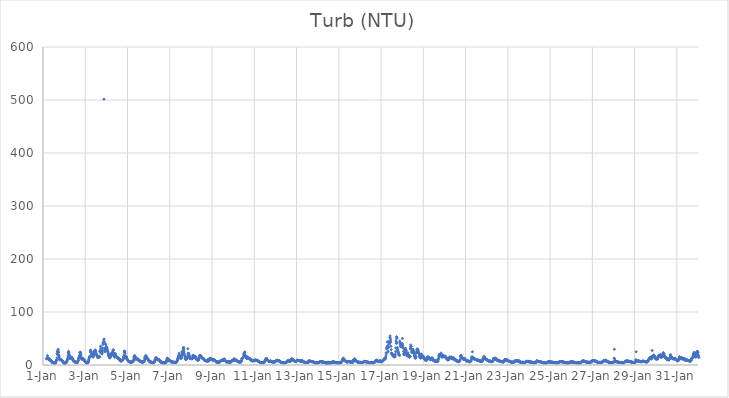
| Category | Turb (NTU) |
|---|---|
| 44562.166666666664 | 11.87 |
| 44562.177083333336 | 12.33 |
| 44562.1875 | 11.19 |
| 44562.197916666664 | 13.07 |
| 44562.208333333336 | 17.6 |
| 44562.21875 | 13.03 |
| 44562.229166666664 | 12.06 |
| 44562.239583333336 | 12.28 |
| 44562.25 | 12.26 |
| 44562.260416666664 | 12.67 |
| 44562.270833333336 | 12.86 |
| 44562.28125 | 11.97 |
| 44562.291666666664 | 9.84 |
| 44562.302083333336 | 9.6 |
| 44562.3125 | 9.68 |
| 44562.322916666664 | 9.43 |
| 44562.333333333336 | 9.88 |
| 44562.34375 | 9.87 |
| 44562.354166666664 | 8.91 |
| 44562.364583333336 | 8.43 |
| 44562.375 | 8.31 |
| 44562.385416666664 | 7.34 |
| 44562.395833333336 | 7.19 |
| 44562.40625 | 6.33 |
| 44562.416666666664 | 6.48 |
| 44562.427083333336 | 5.68 |
| 44562.4375 | 5.01 |
| 44562.447916666664 | 4.82 |
| 44562.458333333336 | 4.68 |
| 44562.46875 | 4.45 |
| 44562.479166666664 | 4.31 |
| 44562.489583333336 | 4.13 |
| 44562.5 | 4.06 |
| 44562.510416666664 | 3.94 |
| 44562.520833333336 | 4 |
| 44562.53125 | 3.86 |
| 44562.541666666664 | 4.03 |
| 44562.552083333336 | 3.84 |
| 44562.5625 | 3.65 |
| 44562.572916666664 | 3.67 |
| 44562.583333333336 | 3.56 |
| 44562.59375 | 4.24 |
| 44562.604166666664 | 6.15 |
| 44562.614583333336 | 5.25 |
| 44562.625 | 8.19 |
| 44562.635416666664 | 8.78 |
| 44562.645833333336 | 8.99 |
| 44562.65625 | 13.36 |
| 44562.666666666664 | 20.85 |
| 44562.677083333336 | 24.94 |
| 44562.6875 | 19.75 |
| 44562.697916666664 | 26.02 |
| 44562.708333333336 | 27.74 |
| 44562.71875 | 29.52 |
| 44562.729166666664 | 23.34 |
| 44562.739583333336 | 24.34 |
| 44562.75 | 18.39 |
| 44562.760416666664 | 15.95 |
| 44562.770833333336 | 12.96 |
| 44562.78125 | 10.43 |
| 44562.791666666664 | 9.8 |
| 44562.802083333336 | 10.56 |
| 44562.8125 | 10.63 |
| 44562.822916666664 | 10.8 |
| 44562.833333333336 | 10.03 |
| 44562.84375 | 10.64 |
| 44562.854166666664 | 9.85 |
| 44562.864583333336 | 9.51 |
| 44562.875 | 9.16 |
| 44562.885416666664 | 8.82 |
| 44562.895833333336 | 8.69 |
| 44562.90625 | 8.57 |
| 44562.916666666664 | 8.16 |
| 44562.927083333336 | 7.28 |
| 44562.9375 | 6.38 |
| 44562.947916666664 | 5.82 |
| 44562.958333333336 | 5.22 |
| 44562.96875 | 4.62 |
| 44562.979166666664 | 4.23 |
| 44562.989583333336 | 3.95 |
| 44563.0 | 3.87 |
| 44563.010416666664 | 3.68 |
| 44563.020833333336 | 3.62 |
| 44563.03125 | 3.65 |
| 44563.041666666664 | 3.76 |
| 44563.052083333336 | 3.66 |
| 44563.0625 | 3.59 |
| 44563.072916666664 | 3.69 |
| 44563.083333333336 | 3.84 |
| 44563.09375 | 4.43 |
| 44563.104166666664 | 5.77 |
| 44563.114583333336 | 6.32 |
| 44563.125 | 5.99 |
| 44563.135416666664 | 7.25 |
| 44563.145833333336 | 8.55 |
| 44563.15625 | 10.62 |
| 44563.166666666664 | 12.01 |
| 44563.177083333336 | 14.79 |
| 44563.1875 | 17.62 |
| 44563.197916666664 | 23.17 |
| 44563.208333333336 | 25.65 |
| 44563.21875 | 22.58 |
| 44563.229166666664 | 24.08 |
| 44563.239583333336 | 19.76 |
| 44563.25 | 18.29 |
| 44563.260416666664 | 16.1 |
| 44563.270833333336 | 13.78 |
| 44563.28125 | 12.2 |
| 44563.291666666664 | 12.46 |
| 44563.302083333336 | 13.33 |
| 44563.3125 | 14.45 |
| 44563.322916666664 | 14.23 |
| 44563.333333333336 | 13.48 |
| 44563.34375 | 14.12 |
| 44563.354166666664 | 14.63 |
| 44563.364583333336 | 12.54 |
| 44563.375 | 12.17 |
| 44563.385416666664 | 12.93 |
| 44563.395833333336 | 11.62 |
| 44563.40625 | 11.87 |
| 44563.416666666664 | 9.66 |
| 44563.427083333336 | 8.95 |
| 44563.4375 | 8.39 |
| 44563.447916666664 | 7.69 |
| 44563.458333333336 | 7.07 |
| 44563.46875 | 6.66 |
| 44563.479166666664 | 6.58 |
| 44563.489583333336 | 6.34 |
| 44563.5 | 5.87 |
| 44563.510416666664 | 5.73 |
| 44563.520833333336 | 5.81 |
| 44563.53125 | 5.25 |
| 44563.541666666664 | 5.42 |
| 44563.552083333336 | 5.41 |
| 44563.5625 | 5.13 |
| 44563.572916666664 | 5 |
| 44563.583333333336 | 4.76 |
| 44563.59375 | 4.59 |
| 44563.604166666664 | 4.41 |
| 44563.614583333336 | 4.5 |
| 44563.625 | 4.77 |
| 44563.635416666664 | 4.74 |
| 44563.645833333336 | 6.84 |
| 44563.65625 | 8.32 |
| 44563.666666666664 | 9.4 |
| 44563.677083333336 | 8.82 |
| 44563.6875 | 12.52 |
| 44563.697916666664 | 14.56 |
| 44563.708333333336 | 14.4 |
| 44563.71875 | 16.66 |
| 44563.729166666664 | 17.57 |
| 44563.739583333336 | 23.82 |
| 44563.75 | 20.22 |
| 44563.760416666664 | 24.24 |
| 44563.770833333336 | 23.83 |
| 44563.78125 | 22.1 |
| 44563.791666666664 | 19.54 |
| 44563.802083333336 | 16.95 |
| 44563.8125 | 13.77 |
| 44563.822916666664 | 11.88 |
| 44563.833333333336 | 11.06 |
| 44563.84375 | 11.74 |
| 44563.854166666664 | 12.36 |
| 44563.864583333336 | 12.05 |
| 44563.875 | 11.91 |
| 44563.885416666664 | 11.82 |
| 44563.895833333336 | 11.77 |
| 44563.90625 | 11.4 |
| 44563.916666666664 | 9.82 |
| 44563.927083333336 | 9.42 |
| 44563.9375 | 10.38 |
| 44563.947916666664 | 9.44 |
| 44563.958333333336 | 8.57 |
| 44563.96875 | 8.02 |
| 44563.979166666664 | 7.27 |
| 44563.989583333336 | 6.69 |
| 44564.0 | 7.07 |
| 44564.010416666664 | 5.65 |
| 44564.020833333336 | 5.23 |
| 44564.03125 | 4.83 |
| 44564.041666666664 | 4.48 |
| 44564.052083333336 | 4.26 |
| 44564.0625 | 4.42 |
| 44564.072916666664 | 4.67 |
| 44564.083333333336 | 4.31 |
| 44564.09375 | 4.08 |
| 44564.104166666664 | 4.32 |
| 44564.114583333336 | 4.35 |
| 44564.125 | 4.79 |
| 44564.135416666664 | 4.95 |
| 44564.145833333336 | 6.38 |
| 44564.15625 | 9.54 |
| 44564.166666666664 | 7.64 |
| 44564.177083333336 | 11.81 |
| 44564.1875 | 15.1 |
| 44564.197916666664 | 15.05 |
| 44564.208333333336 | 15.42 |
| 44564.21875 | 15.52 |
| 44564.229166666664 | 17.11 |
| 44564.239583333336 | 24.64 |
| 44564.25 | 28.03 |
| 44564.260416666664 | 26.59 |
| 44564.270833333336 | 25.41 |
| 44564.28125 | 23.19 |
| 44564.291666666664 | 22.75 |
| 44564.302083333336 | 20.21 |
| 44564.3125 | 18.89 |
| 44564.322916666664 | 17.23 |
| 44564.333333333336 | 16.7 |
| 44564.34375 | 17.23 |
| 44564.354166666664 | 19.74 |
| 44564.364583333336 | 18.64 |
| 44564.375 | 14.87 |
| 44564.385416666664 | 16.54 |
| 44564.395833333336 | 18.51 |
| 44564.40625 | 21.49 |
| 44564.416666666664 | 25.74 |
| 44564.427083333336 | 25.84 |
| 44564.4375 | 25.01 |
| 44564.447916666664 | 26.96 |
| 44564.458333333336 | 27.28 |
| 44564.46875 | 27.46 |
| 44564.479166666664 | 28.1 |
| 44564.489583333336 | 26.2 |
| 44564.5 | 24.45 |
| 44564.510416666664 | 21.83 |
| 44564.520833333336 | 20.83 |
| 44564.53125 | 19.97 |
| 44564.541666666664 | 18.99 |
| 44564.552083333336 | 18.12 |
| 44564.5625 | 16.41 |
| 44564.572916666664 | 14.63 |
| 44564.583333333336 | 14.82 |
| 44564.59375 | 14.29 |
| 44564.604166666664 | 13.79 |
| 44564.614583333336 | 14.65 |
| 44564.625 | 15.38 |
| 44564.635416666664 | 15.62 |
| 44564.645833333336 | 14.66 |
| 44564.65625 | 15.41 |
| 44564.666666666664 | 16.86 |
| 44564.677083333336 | 15.53 |
| 44564.6875 | 25.09 |
| 44564.697916666664 | 27.29 |
| 44564.708333333336 | 26.28 |
| 44564.71875 | 35.2 |
| 44564.729166666664 | 26.45 |
| 44564.739583333336 | 30.86 |
| 44564.75 | 25.49 |
| 44564.760416666664 | 22.16 |
| 44564.770833333336 | 23.63 |
| 44564.78125 | 23.73 |
| 44564.791666666664 | 23.66 |
| 44564.802083333336 | 21.17 |
| 44564.8125 | 31.92 |
| 44564.822916666664 | 27.49 |
| 44564.833333333336 | 38.8 |
| 44564.84375 | 42.27 |
| 44564.854166666664 | 40.99 |
| 44564.864583333336 | 42.98 |
| 44564.875 | 47.48 |
| 44564.885416666664 | 501.5 |
| 44564.895833333336 | 48.89 |
| 44564.90625 | 43.59 |
| 44564.916666666664 | 31.32 |
| 44564.927083333336 | 26.12 |
| 44564.9375 | 25.48 |
| 44564.947916666664 | 29.15 |
| 44564.958333333336 | 38.98 |
| 44564.96875 | 38.8 |
| 44564.979166666664 | 29.47 |
| 44564.989583333336 | 33.99 |
| 44565.0 | 33.92 |
| 44565.010416666664 | 34.01 |
| 44565.020833333336 | 32.43 |
| 44565.03125 | 31.24 |
| 44565.041666666664 | 28.65 |
| 44565.052083333336 | 27.05 |
| 44565.0625 | 25.4 |
| 44565.072916666664 | 23.75 |
| 44565.083333333336 | 22.18 |
| 44565.09375 | 18.03 |
| 44565.104166666664 | 19.26 |
| 44565.114583333336 | 17.18 |
| 44565.125 | 19.57 |
| 44565.135416666664 | 14.8 |
| 44565.145833333336 | 13.68 |
| 44565.15625 | 13.51 |
| 44565.166666666664 | 16.06 |
| 44565.177083333336 | 15.92 |
| 44565.1875 | 14.07 |
| 44565.197916666664 | 16.85 |
| 44565.208333333336 | 16.8 |
| 44565.21875 | 20.48 |
| 44565.229166666664 | 17.52 |
| 44565.239583333336 | 17.49 |
| 44565.25 | 22.36 |
| 44565.260416666664 | 22.65 |
| 44565.270833333336 | 20.27 |
| 44565.28125 | 22.79 |
| 44565.291666666664 | 21.32 |
| 44565.302083333336 | 23.85 |
| 44565.3125 | 27.18 |
| 44565.322916666664 | 28.89 |
| 44565.333333333336 | 27.66 |
| 44565.34375 | 23.05 |
| 44565.354166666664 | 19.9 |
| 44565.364583333336 | 19.01 |
| 44565.375 | 17.16 |
| 44565.385416666664 | 15.95 |
| 44565.395833333336 | 14.79 |
| 44565.40625 | 19.18 |
| 44565.416666666664 | 19.34 |
| 44565.427083333336 | 21.53 |
| 44565.4375 | 17.85 |
| 44565.447916666664 | 16.26 |
| 44565.458333333336 | 16.37 |
| 44565.46875 | 15.8 |
| 44565.479166666664 | 14.9 |
| 44565.489583333336 | 14.27 |
| 44565.5 | 14.01 |
| 44565.510416666664 | 14.61 |
| 44565.520833333336 | 14.1 |
| 44565.53125 | 13.87 |
| 44565.541666666664 | 13.44 |
| 44565.552083333336 | 12.83 |
| 44565.5625 | 12.48 |
| 44565.572916666664 | 12.09 |
| 44565.583333333336 | 11.77 |
| 44565.59375 | 11.38 |
| 44565.604166666664 | 11.29 |
| 44565.614583333336 | 11.36 |
| 44565.625 | 10.97 |
| 44565.635416666664 | 9.95 |
| 44565.645833333336 | 10.29 |
| 44565.65625 | 8.15 |
| 44565.666666666664 | 7.56 |
| 44565.677083333336 | 7.98 |
| 44565.6875 | 7.72 |
| 44565.697916666664 | 8.15 |
| 44565.708333333336 | 8.54 |
| 44565.71875 | 7.9 |
| 44565.729166666664 | 7.39 |
| 44565.739583333336 | 8.46 |
| 44565.75 | 8.84 |
| 44565.760416666664 | 8.78 |
| 44565.770833333336 | 10.27 |
| 44565.78125 | 10.83 |
| 44565.791666666664 | 10.24 |
| 44565.802083333336 | 12.97 |
| 44565.8125 | 14.79 |
| 44565.822916666664 | 15.74 |
| 44565.833333333336 | 18.82 |
| 44565.84375 | 24.3 |
| 44565.854166666664 | 26.4 |
| 44565.864583333336 | 25.36 |
| 44565.875 | 25.13 |
| 44565.885416666664 | 22.09 |
| 44565.895833333336 | 16.62 |
| 44565.90625 | 13.31 |
| 44565.916666666664 | 14.26 |
| 44565.927083333336 | 14.68 |
| 44565.9375 | 15.62 |
| 44565.947916666664 | 15.09 |
| 44565.958333333336 | 14.62 |
| 44565.96875 | 12.5 |
| 44565.979166666664 | 10.67 |
| 44565.989583333336 | 10.74 |
| 44566.0 | 9.47 |
| 44566.010416666664 | 9.03 |
| 44566.020833333336 | 8.73 |
| 44566.03125 | 8.12 |
| 44566.041666666664 | 7.81 |
| 44566.052083333336 | 7.04 |
| 44566.0625 | 6.72 |
| 44566.072916666664 | 6.59 |
| 44566.083333333336 | 6.33 |
| 44566.09375 | 6.26 |
| 44566.104166666664 | 5.79 |
| 44566.114583333336 | 5.65 |
| 44566.125 | 5.73 |
| 44566.135416666664 | 5.37 |
| 44566.145833333336 | 5.38 |
| 44566.15625 | 5.63 |
| 44566.166666666664 | 5.41 |
| 44566.177083333336 | 5.2 |
| 44566.1875 | 5.2 |
| 44566.197916666664 | 5.09 |
| 44566.208333333336 | 5.43 |
| 44566.21875 | 6.01 |
| 44566.229166666664 | 6.21 |
| 44566.239583333336 | 6.5 |
| 44566.25 | 6.62 |
| 44566.260416666664 | 6.8 |
| 44566.270833333336 | 7.51 |
| 44566.28125 | 8.62 |
| 44566.291666666664 | 10.92 |
| 44566.302083333336 | 14.37 |
| 44566.3125 | 15.92 |
| 44566.322916666664 | 15.14 |
| 44566.333333333336 | 17.74 |
| 44566.34375 | 15.79 |
| 44566.354166666664 | 13.89 |
| 44566.364583333336 | 16.73 |
| 44566.375 | 13.22 |
| 44566.385416666664 | 11.43 |
| 44566.395833333336 | 10.72 |
| 44566.40625 | 11.94 |
| 44566.416666666664 | 11.54 |
| 44566.427083333336 | 11.24 |
| 44566.4375 | 12.31 |
| 44566.447916666664 | 11.96 |
| 44566.458333333336 | 12.26 |
| 44566.46875 | 11.6 |
| 44566.479166666664 | 10.86 |
| 44566.489583333336 | 10.03 |
| 44566.5 | 9.4 |
| 44566.510416666664 | 9.4 |
| 44566.520833333336 | 9.75 |
| 44566.53125 | 9.52 |
| 44566.541666666664 | 9.24 |
| 44566.552083333336 | 8.59 |
| 44566.5625 | 9.1 |
| 44566.572916666664 | 7.66 |
| 44566.583333333336 | 7.56 |
| 44566.59375 | 6.94 |
| 44566.604166666664 | 6.85 |
| 44566.614583333336 | 6.66 |
| 44566.625 | 6.6 |
| 44566.635416666664 | 6.29 |
| 44566.645833333336 | 5.96 |
| 44566.65625 | 5.85 |
| 44566.666666666664 | 6.3 |
| 44566.677083333336 | 6.08 |
| 44566.6875 | 5.56 |
| 44566.697916666664 | 5.28 |
| 44566.708333333336 | 5.14 |
| 44566.71875 | 5.29 |
| 44566.729166666664 | 6.48 |
| 44566.739583333336 | 6.16 |
| 44566.75 | 6.08 |
| 44566.760416666664 | 6.26 |
| 44566.770833333336 | 5.87 |
| 44566.78125 | 6.82 |
| 44566.791666666664 | 6.74 |
| 44566.802083333336 | 8.95 |
| 44566.8125 | 14.7 |
| 44566.822916666664 | 12.36 |
| 44566.833333333336 | 12 |
| 44566.84375 | 13.57 |
| 44566.854166666664 | 16.04 |
| 44566.864583333336 | 17.65 |
| 44566.875 | 16.55 |
| 44566.885416666664 | 16.57 |
| 44566.895833333336 | 14.19 |
| 44566.90625 | 13.72 |
| 44566.916666666664 | 12.51 |
| 44566.927083333336 | 11.72 |
| 44566.9375 | 11.74 |
| 44566.947916666664 | 11.47 |
| 44566.958333333336 | 11.43 |
| 44566.96875 | 11.4 |
| 44566.979166666664 | 10.87 |
| 44566.989583333336 | 9.86 |
| 44567.0 | 8.65 |
| 44567.010416666664 | 8.23 |
| 44567.020833333336 | 7.29 |
| 44567.03125 | 6.73 |
| 44567.041666666664 | 6.52 |
| 44567.052083333336 | 6.26 |
| 44567.0625 | 5.77 |
| 44567.072916666664 | 5.83 |
| 44567.083333333336 | 5.66 |
| 44567.09375 | 5.38 |
| 44567.104166666664 | 5.42 |
| 44567.114583333336 | 5.45 |
| 44567.125 | 5.48 |
| 44567.135416666664 | 5.27 |
| 44567.145833333336 | 4.66 |
| 44567.15625 | 4.5 |
| 44567.166666666664 | 4.41 |
| 44567.177083333336 | 4.62 |
| 44567.1875 | 4.53 |
| 44567.197916666664 | 4.09 |
| 44567.208333333336 | 4.19 |
| 44567.21875 | 4.21 |
| 44567.229166666664 | 4.34 |
| 44567.239583333336 | 5.17 |
| 44567.25 | 5.42 |
| 44567.260416666664 | 5.83 |
| 44567.270833333336 | 5.97 |
| 44567.28125 | 6.25 |
| 44567.291666666664 | 7.7 |
| 44567.302083333336 | 9.53 |
| 44567.3125 | 10.76 |
| 44567.322916666664 | 10.49 |
| 44567.333333333336 | 11.66 |
| 44567.34375 | 13.93 |
| 44567.354166666664 | 13.69 |
| 44567.364583333336 | 12.6 |
| 44567.375 | 12.5 |
| 44567.385416666664 | 12.06 |
| 44567.395833333336 | 12.45 |
| 44567.40625 | 11.75 |
| 44567.416666666664 | 10.6 |
| 44567.427083333336 | 9.63 |
| 44567.4375 | 10.24 |
| 44567.447916666664 | 10.51 |
| 44567.458333333336 | 10.38 |
| 44567.46875 | 9.95 |
| 44567.479166666664 | 9.36 |
| 44567.489583333336 | 9.79 |
| 44567.5 | 9.54 |
| 44567.510416666664 | 9.33 |
| 44567.520833333336 | 8.41 |
| 44567.53125 | 7.57 |
| 44567.541666666664 | 6.85 |
| 44567.552083333336 | 6.25 |
| 44567.5625 | 5.75 |
| 44567.572916666664 | 5.85 |
| 44567.583333333336 | 5.68 |
| 44567.59375 | 5.33 |
| 44567.604166666664 | 5.33 |
| 44567.614583333336 | 5.5 |
| 44567.625 | 5.37 |
| 44567.635416666664 | 5.04 |
| 44567.645833333336 | 4.71 |
| 44567.65625 | 4.59 |
| 44567.666666666664 | 4.19 |
| 44567.677083333336 | 5.15 |
| 44567.6875 | 4.32 |
| 44567.697916666664 | 4.59 |
| 44567.708333333336 | 4.65 |
| 44567.71875 | 3.88 |
| 44567.729166666664 | 3.65 |
| 44567.739583333336 | 3.75 |
| 44567.75 | 3.86 |
| 44567.760416666664 | 3.88 |
| 44567.770833333336 | 4.3 |
| 44567.78125 | 4.6 |
| 44567.791666666664 | 4.29 |
| 44567.802083333336 | 3.92 |
| 44567.8125 | 4.47 |
| 44567.822916666664 | 4.73 |
| 44567.833333333336 | 6.36 |
| 44567.84375 | 7.47 |
| 44567.854166666664 | 8.92 |
| 44567.864583333336 | 10.87 |
| 44567.875 | 12.91 |
| 44567.885416666664 | 12.53 |
| 44567.895833333336 | 11.28 |
| 44567.90625 | 11.83 |
| 44567.916666666664 | 10.72 |
| 44567.927083333336 | 10.31 |
| 44567.9375 | 10.02 |
| 44567.947916666664 | 8.9 |
| 44567.958333333336 | 7.92 |
| 44567.96875 | 8.92 |
| 44567.979166666664 | 9.29 |
| 44567.989583333336 | 8.71 |
| 44568.0 | 8.71 |
| 44568.010416666664 | 8.51 |
| 44568.020833333336 | 7.76 |
| 44568.03125 | 7.36 |
| 44568.041666666664 | 6.78 |
| 44568.052083333336 | 6.56 |
| 44568.0625 | 5.97 |
| 44568.072916666664 | 6.09 |
| 44568.083333333336 | 5.91 |
| 44568.09375 | 5.78 |
| 44568.104166666664 | 5.77 |
| 44568.114583333336 | 5.69 |
| 44568.125 | 5.8 |
| 44568.135416666664 | 5.69 |
| 44568.145833333336 | 5.83 |
| 44568.15625 | 5.46 |
| 44568.166666666664 | 5.32 |
| 44568.177083333336 | 5.25 |
| 44568.1875 | 5.06 |
| 44568.197916666664 | 4.97 |
| 44568.208333333336 | 4.77 |
| 44568.21875 | 4.93 |
| 44568.229166666664 | 4.75 |
| 44568.239583333336 | 4.2 |
| 44568.25 | 4.31 |
| 44568.260416666664 | 4.37 |
| 44568.270833333336 | 4.55 |
| 44568.28125 | 4.89 |
| 44568.291666666664 | 5.2 |
| 44568.302083333336 | 4.96 |
| 44568.3125 | 5.34 |
| 44568.322916666664 | 5.72 |
| 44568.333333333336 | 6.73 |
| 44568.34375 | 7.7 |
| 44568.354166666664 | 8.11 |
| 44568.364583333336 | 11.15 |
| 44568.375 | 12.84 |
| 44568.385416666664 | 9.77 |
| 44568.395833333336 | 12.23 |
| 44568.40625 | 15.03 |
| 44568.416666666664 | 16.91 |
| 44568.427083333336 | 17.48 |
| 44568.4375 | 21.72 |
| 44568.447916666664 | 19.45 |
| 44568.458333333336 | 18.12 |
| 44568.46875 | 16.16 |
| 44568.479166666664 | 15.79 |
| 44568.489583333336 | 14.37 |
| 44568.5 | 13.18 |
| 44568.510416666664 | 13.38 |
| 44568.520833333336 | 13.1 |
| 44568.53125 | 12.41 |
| 44568.541666666664 | 12.92 |
| 44568.552083333336 | 13.34 |
| 44568.5625 | 16.85 |
| 44568.572916666664 | 23.58 |
| 44568.583333333336 | 25.5 |
| 44568.59375 | 20.39 |
| 44568.604166666664 | 19.04 |
| 44568.614583333336 | 22.1 |
| 44568.625 | 23.83 |
| 44568.635416666664 | 30.63 |
| 44568.645833333336 | 32.35 |
| 44568.65625 | 33.22 |
| 44568.666666666664 | 28.62 |
| 44568.677083333336 | 24.25 |
| 44568.6875 | 20.74 |
| 44568.697916666664 | 18.27 |
| 44568.708333333336 | 17.56 |
| 44568.71875 | 14.92 |
| 44568.729166666664 | 13.02 |
| 44568.739583333336 | 12.03 |
| 44568.75 | 11.65 |
| 44568.760416666664 | 10.11 |
| 44568.770833333336 | 10.85 |
| 44568.78125 | 11.13 |
| 44568.791666666664 | 12.66 |
| 44568.802083333336 | 13.08 |
| 44568.8125 | 11.85 |
| 44568.822916666664 | 12.09 |
| 44568.833333333336 | 13.07 |
| 44568.84375 | 16.62 |
| 44568.854166666664 | 30.62 |
| 44568.864583333336 | 21.83 |
| 44568.875 | 19.83 |
| 44568.885416666664 | 21.8 |
| 44568.895833333336 | 21.8 |
| 44568.90625 | 20.19 |
| 44568.916666666664 | 17.95 |
| 44568.927083333336 | 16.7 |
| 44568.9375 | 15.62 |
| 44568.947916666664 | 14.97 |
| 44568.958333333336 | 11.89 |
| 44568.96875 | 13.52 |
| 44568.979166666664 | 13.17 |
| 44568.989583333336 | 12.1 |
| 44569.0 | 11.88 |
| 44569.010416666664 | 12.4 |
| 44569.020833333336 | 11.82 |
| 44569.03125 | 11.92 |
| 44569.041666666664 | 12.18 |
| 44569.052083333336 | 11.55 |
| 44569.0625 | 12.36 |
| 44569.072916666664 | 13.78 |
| 44569.083333333336 | 14.84 |
| 44569.09375 | 18.26 |
| 44569.104166666664 | 17.56 |
| 44569.114583333336 | 17.19 |
| 44569.125 | 14.45 |
| 44569.135416666664 | 13.52 |
| 44569.145833333336 | 13.5 |
| 44569.15625 | 14.31 |
| 44569.166666666664 | 15.48 |
| 44569.177083333336 | 15.94 |
| 44569.1875 | 16.9 |
| 44569.197916666664 | 16.42 |
| 44569.208333333336 | 15.45 |
| 44569.21875 | 15.19 |
| 44569.229166666664 | 13.52 |
| 44569.239583333336 | 14.1 |
| 44569.25 | 11.49 |
| 44569.260416666664 | 11.8 |
| 44569.270833333336 | 10.54 |
| 44569.28125 | 9.97 |
| 44569.291666666664 | 10 |
| 44569.302083333336 | 10.35 |
| 44569.3125 | 9.71 |
| 44569.322916666664 | 9.11 |
| 44569.333333333336 | 8.58 |
| 44569.34375 | 9.3 |
| 44569.354166666664 | 9.59 |
| 44569.364583333336 | 10.01 |
| 44569.375 | 11.99 |
| 44569.385416666664 | 13.29 |
| 44569.395833333336 | 15.45 |
| 44569.40625 | 16.77 |
| 44569.416666666664 | 17.95 |
| 44569.427083333336 | 17.63 |
| 44569.4375 | 17.05 |
| 44569.447916666664 | 17.85 |
| 44569.458333333336 | 17.6 |
| 44569.46875 | 17.54 |
| 44569.479166666664 | 16.24 |
| 44569.489583333336 | 15.45 |
| 44569.5 | 14.42 |
| 44569.510416666664 | 13.49 |
| 44569.520833333336 | 13.47 |
| 44569.53125 | 13.72 |
| 44569.541666666664 | 13.28 |
| 44569.552083333336 | 12.54 |
| 44569.5625 | 12.39 |
| 44569.572916666664 | 12.09 |
| 44569.583333333336 | 12.28 |
| 44569.59375 | 12.17 |
| 44569.604166666664 | 11.72 |
| 44569.614583333336 | 11.49 |
| 44569.625 | 10 |
| 44569.635416666664 | 9.07 |
| 44569.645833333336 | 8.88 |
| 44569.65625 | 8.35 |
| 44569.666666666664 | 8.23 |
| 44569.677083333336 | 7.99 |
| 44569.6875 | 8.42 |
| 44569.697916666664 | 8.16 |
| 44569.708333333336 | 8.1 |
| 44569.71875 | 8 |
| 44569.729166666664 | 8.13 |
| 44569.739583333336 | 7.89 |
| 44569.75 | 7.33 |
| 44569.760416666664 | 7.73 |
| 44569.770833333336 | 7.89 |
| 44569.78125 | 7.37 |
| 44569.791666666664 | 6.82 |
| 44569.802083333336 | 7.15 |
| 44569.8125 | 10.97 |
| 44569.822916666664 | 8.96 |
| 44569.833333333336 | 7.81 |
| 44569.84375 | 8.39 |
| 44569.854166666664 | 7.65 |
| 44569.864583333336 | 8.01 |
| 44569.875 | 10.22 |
| 44569.885416666664 | 11.67 |
| 44569.895833333336 | 12.61 |
| 44569.90625 | 12.55 |
| 44569.916666666664 | 12.11 |
| 44569.927083333336 | 11.99 |
| 44569.9375 | 12.42 |
| 44569.947916666664 | 11.39 |
| 44569.958333333336 | 11.27 |
| 44569.96875 | 10.75 |
| 44569.979166666664 | 10.44 |
| 44569.989583333336 | 10.54 |
| 44570.0 | 11.01 |
| 44570.010416666664 | 10.26 |
| 44570.020833333336 | 9.94 |
| 44570.03125 | 9.29 |
| 44570.041666666664 | 9.34 |
| 44570.052083333336 | 9.18 |
| 44570.0625 | 9.92 |
| 44570.072916666664 | 10.33 |
| 44570.083333333336 | 9.82 |
| 44570.09375 | 9.99 |
| 44570.104166666664 | 9.94 |
| 44570.114583333336 | 9.57 |
| 44570.125 | 8.83 |
| 44570.135416666664 | 7.97 |
| 44570.145833333336 | 7.82 |
| 44570.15625 | 7.52 |
| 44570.166666666664 | 6.9 |
| 44570.177083333336 | 6.4 |
| 44570.1875 | 6.07 |
| 44570.197916666664 | 5.76 |
| 44570.208333333336 | 5.81 |
| 44570.21875 | 5.64 |
| 44570.229166666664 | 5.52 |
| 44570.239583333336 | 5.4 |
| 44570.25 | 5.44 |
| 44570.260416666664 | 6.01 |
| 44570.270833333336 | 5.62 |
| 44570.28125 | 5.62 |
| 44570.291666666664 | 5.21 |
| 44570.302083333336 | 5.11 |
| 44570.3125 | 5.08 |
| 44570.322916666664 | 5.36 |
| 44570.333333333336 | 5.38 |
| 44570.34375 | 5.92 |
| 44570.354166666664 | 5.33 |
| 44570.364583333336 | 5.56 |
| 44570.375 | 6.57 |
| 44570.385416666664 | 7.48 |
| 44570.395833333336 | 6.99 |
| 44570.40625 | 8.09 |
| 44570.416666666664 | 8.39 |
| 44570.427083333336 | 8.25 |
| 44570.4375 | 8.56 |
| 44570.447916666664 | 8.35 |
| 44570.458333333336 | 8.2 |
| 44570.46875 | 8.35 |
| 44570.479166666664 | 8.4 |
| 44570.489583333336 | 8.81 |
| 44570.5 | 8.88 |
| 44570.510416666664 | 9.86 |
| 44570.520833333336 | 10.62 |
| 44570.53125 | 9.38 |
| 44570.541666666664 | 8.34 |
| 44570.552083333336 | 9.92 |
| 44570.5625 | 9.25 |
| 44570.572916666664 | 11.41 |
| 44570.583333333336 | 11.14 |
| 44570.59375 | 9.86 |
| 44570.604166666664 | 9.49 |
| 44570.614583333336 | 8.65 |
| 44570.625 | 8.01 |
| 44570.635416666664 | 7.43 |
| 44570.645833333336 | 7.01 |
| 44570.65625 | 6.74 |
| 44570.666666666664 | 6.34 |
| 44570.677083333336 | 6.03 |
| 44570.6875 | 5.83 |
| 44570.697916666664 | 5.5 |
| 44570.708333333336 | 5.83 |
| 44570.71875 | 6.74 |
| 44570.729166666664 | 6.04 |
| 44570.739583333336 | 6.38 |
| 44570.75 | 6.31 |
| 44570.760416666664 | 6.08 |
| 44570.770833333336 | 5.8 |
| 44570.78125 | 5.93 |
| 44570.791666666664 | 5.6 |
| 44570.802083333336 | 6.53 |
| 44570.8125 | 5.5 |
| 44570.822916666664 | 5.19 |
| 44570.833333333336 | 5.32 |
| 44570.84375 | 5.04 |
| 44570.854166666664 | 5.04 |
| 44570.864583333336 | 5.24 |
| 44570.875 | 5.38 |
| 44570.885416666664 | 5.37 |
| 44570.895833333336 | 5.76 |
| 44570.90625 | 6.36 |
| 44570.916666666664 | 7.36 |
| 44570.927083333336 | 8.18 |
| 44570.9375 | 8.07 |
| 44570.947916666664 | 8.13 |
| 44570.958333333336 | 8.03 |
| 44570.96875 | 8.27 |
| 44570.979166666664 | 8.58 |
| 44570.989583333336 | 9.15 |
| 44571.0 | 8.88 |
| 44571.010416666664 | 9.03 |
| 44571.020833333336 | 9.31 |
| 44571.03125 | 10.65 |
| 44571.041666666664 | 11.83 |
| 44571.052083333336 | 8.32 |
| 44571.0625 | 8.13 |
| 44571.072916666664 | 9.01 |
| 44571.083333333336 | 10.58 |
| 44571.09375 | 9.99 |
| 44571.104166666664 | 9.29 |
| 44571.114583333336 | 8.99 |
| 44571.125 | 9.16 |
| 44571.135416666664 | 9.58 |
| 44571.145833333336 | 8.78 |
| 44571.15625 | 8.82 |
| 44571.166666666664 | 8.59 |
| 44571.177083333336 | 7.96 |
| 44571.1875 | 7.25 |
| 44571.197916666664 | 7.16 |
| 44571.208333333336 | 6.71 |
| 44571.21875 | 6.43 |
| 44571.229166666664 | 6.31 |
| 44571.239583333336 | 6.32 |
| 44571.25 | 5.91 |
| 44571.260416666664 | 6.01 |
| 44571.270833333336 | 6.25 |
| 44571.28125 | 6.08 |
| 44571.291666666664 | 5.7 |
| 44571.302083333336 | 5.45 |
| 44571.3125 | 6.04 |
| 44571.322916666664 | 5.29 |
| 44571.333333333336 | 5.24 |
| 44571.34375 | 5.52 |
| 44571.354166666664 | 5.94 |
| 44571.364583333336 | 6.48 |
| 44571.375 | 5.95 |
| 44571.385416666664 | 7.93 |
| 44571.395833333336 | 8.17 |
| 44571.40625 | 10.97 |
| 44571.416666666664 | 12.48 |
| 44571.427083333336 | 12.41 |
| 44571.4375 | 12.84 |
| 44571.447916666664 | 12.86 |
| 44571.458333333336 | 13.2 |
| 44571.46875 | 14.12 |
| 44571.479166666664 | 14.93 |
| 44571.489583333336 | 15.98 |
| 44571.5 | 19.13 |
| 44571.510416666664 | 22.3 |
| 44571.520833333336 | 21.23 |
| 44571.53125 | 20.83 |
| 44571.541666666664 | 20.02 |
| 44571.552083333336 | 24.67 |
| 44571.5625 | 16.33 |
| 44571.572916666664 | 15.58 |
| 44571.583333333336 | 16.14 |
| 44571.59375 | 17.29 |
| 44571.604166666664 | 15.82 |
| 44571.614583333336 | 13.89 |
| 44571.625 | 13.04 |
| 44571.635416666664 | 12.82 |
| 44571.645833333336 | 12.63 |
| 44571.65625 | 12.62 |
| 44571.666666666664 | 15.36 |
| 44571.677083333336 | 15.27 |
| 44571.6875 | 14.01 |
| 44571.697916666664 | 13.48 |
| 44571.708333333336 | 12.2 |
| 44571.71875 | 12.62 |
| 44571.729166666664 | 12.94 |
| 44571.739583333336 | 13.2 |
| 44571.75 | 12.47 |
| 44571.760416666664 | 12.16 |
| 44571.770833333336 | 11.9 |
| 44571.78125 | 12 |
| 44571.791666666664 | 11.28 |
| 44571.802083333336 | 11.95 |
| 44571.8125 | 11.35 |
| 44571.822916666664 | 9.93 |
| 44571.833333333336 | 9.7 |
| 44571.84375 | 9.94 |
| 44571.854166666664 | 9.02 |
| 44571.864583333336 | 8.91 |
| 44571.875 | 8.5 |
| 44571.885416666664 | 8.39 |
| 44571.895833333336 | 8.18 |
| 44571.90625 | 7.8 |
| 44571.916666666664 | 7.72 |
| 44571.927083333336 | 7.89 |
| 44571.9375 | 7.89 |
| 44571.947916666664 | 7.99 |
| 44571.958333333336 | 8.87 |
| 44571.96875 | 8.24 |
| 44571.979166666664 | 8.35 |
| 44571.989583333336 | 8.2 |
| 44572.0 | 8.11 |
| 44572.010416666664 | 8.38 |
| 44572.020833333336 | 8.93 |
| 44572.03125 | 9.03 |
| 44572.041666666664 | 9.25 |
| 44572.052083333336 | 9.2 |
| 44572.0625 | 9.2 |
| 44572.072916666664 | 9.28 |
| 44572.083333333336 | 9.19 |
| 44572.09375 | 8.86 |
| 44572.104166666664 | 8.79 |
| 44572.114583333336 | 8.43 |
| 44572.125 | 9 |
| 44572.135416666664 | 8.49 |
| 44572.145833333336 | 8.25 |
| 44572.15625 | 8.01 |
| 44572.166666666664 | 7.87 |
| 44572.177083333336 | 7.89 |
| 44572.1875 | 7.26 |
| 44572.197916666664 | 7.08 |
| 44572.208333333336 | 6.41 |
| 44572.21875 | 6.41 |
| 44572.229166666664 | 6.13 |
| 44572.239583333336 | 5.76 |
| 44572.25 | 5.47 |
| 44572.260416666664 | 5.26 |
| 44572.270833333336 | 5.1 |
| 44572.28125 | 4.88 |
| 44572.291666666664 | 4.85 |
| 44572.302083333336 | 4.7 |
| 44572.3125 | 4.69 |
| 44572.322916666664 | 4.68 |
| 44572.333333333336 | 4.56 |
| 44572.34375 | 4.5 |
| 44572.354166666664 | 4.52 |
| 44572.364583333336 | 4.52 |
| 44572.375 | 4.54 |
| 44572.385416666664 | 4.58 |
| 44572.395833333336 | 4.33 |
| 44572.40625 | 4.25 |
| 44572.416666666664 | 4.48 |
| 44572.427083333336 | 4.25 |
| 44572.4375 | 4.7 |
| 44572.447916666664 | 4.58 |
| 44572.458333333336 | 4.61 |
| 44572.46875 | 4.8 |
| 44572.479166666664 | 6.24 |
| 44572.489583333336 | 6.82 |
| 44572.5 | 7.14 |
| 44572.510416666664 | 7.67 |
| 44572.520833333336 | 9.08 |
| 44572.53125 | 9.9 |
| 44572.541666666664 | 10.67 |
| 44572.552083333336 | 11.63 |
| 44572.5625 | 12.03 |
| 44572.572916666664 | 12 |
| 44572.583333333336 | 12.49 |
| 44572.59375 | 11.08 |
| 44572.604166666664 | 10.25 |
| 44572.614583333336 | 9.8 |
| 44572.625 | 8.97 |
| 44572.635416666664 | 8.7 |
| 44572.645833333336 | 8.86 |
| 44572.65625 | 8.15 |
| 44572.666666666664 | 7.89 |
| 44572.677083333336 | 7.5 |
| 44572.6875 | 7.06 |
| 44572.697916666664 | 6.87 |
| 44572.708333333336 | 6.81 |
| 44572.71875 | 6.46 |
| 44572.729166666664 | 6.38 |
| 44572.739583333336 | 6.17 |
| 44572.75 | 6.81 |
| 44572.760416666664 | 7.8 |
| 44572.770833333336 | 7.72 |
| 44572.78125 | 7.46 |
| 44572.791666666664 | 6.52 |
| 44572.802083333336 | 6.27 |
| 44572.8125 | 6.15 |
| 44572.822916666664 | 6.71 |
| 44572.833333333336 | 6.12 |
| 44572.84375 | 6.24 |
| 44572.854166666664 | 5.97 |
| 44572.864583333336 | 6.04 |
| 44572.875 | 5.84 |
| 44572.885416666664 | 5.71 |
| 44572.895833333336 | 5.78 |
| 44572.90625 | 5.6 |
| 44572.916666666664 | 5.49 |
| 44572.927083333336 | 5.52 |
| 44572.9375 | 5.35 |
| 44572.947916666664 | 5.8 |
| 44572.958333333336 | 6.1 |
| 44572.96875 | 5.81 |
| 44572.979166666664 | 5.73 |
| 44572.989583333336 | 6.57 |
| 44573.0 | 6.58 |
| 44573.010416666664 | 7.68 |
| 44573.020833333336 | 7.66 |
| 44573.03125 | 7.91 |
| 44573.041666666664 | 8.15 |
| 44573.052083333336 | 8.15 |
| 44573.0625 | 8.55 |
| 44573.072916666664 | 8.74 |
| 44573.083333333336 | 8.94 |
| 44573.09375 | 8.9 |
| 44573.104166666664 | 8.63 |
| 44573.114583333336 | 8.58 |
| 44573.125 | 8.45 |
| 44573.135416666664 | 7.66 |
| 44573.145833333336 | 7.86 |
| 44573.15625 | 7.9 |
| 44573.166666666664 | 7.62 |
| 44573.177083333336 | 8.16 |
| 44573.1875 | 7.15 |
| 44573.197916666664 | 7.24 |
| 44573.208333333336 | 6.59 |
| 44573.21875 | 6.54 |
| 44573.229166666664 | 5.95 |
| 44573.239583333336 | 5.5 |
| 44573.25 | 5.45 |
| 44573.260416666664 | 5.4 |
| 44573.270833333336 | 5.09 |
| 44573.28125 | 5.09 |
| 44573.291666666664 | 4.91 |
| 44573.302083333336 | 4.66 |
| 44573.3125 | 4.7 |
| 44573.322916666664 | 4.67 |
| 44573.333333333336 | 4.45 |
| 44573.34375 | 4.45 |
| 44573.354166666664 | 4.37 |
| 44573.364583333336 | 4.4 |
| 44573.375 | 4.25 |
| 44573.385416666664 | 4.27 |
| 44573.395833333336 | 4.17 |
| 44573.40625 | 4.54 |
| 44573.416666666664 | 4.69 |
| 44573.427083333336 | 4.62 |
| 44573.4375 | 4.16 |
| 44573.447916666664 | 4.12 |
| 44573.458333333336 | 4.21 |
| 44573.46875 | 4.25 |
| 44573.479166666664 | 4.45 |
| 44573.489583333336 | 4.44 |
| 44573.5 | 4.56 |
| 44573.510416666664 | 4.87 |
| 44573.520833333336 | 4.8 |
| 44573.53125 | 5.85 |
| 44573.541666666664 | 6.17 |
| 44573.552083333336 | 7.37 |
| 44573.5625 | 7.6 |
| 44573.572916666664 | 7.63 |
| 44573.583333333336 | 7.56 |
| 44573.59375 | 7.79 |
| 44573.604166666664 | 7.67 |
| 44573.614583333336 | 7.34 |
| 44573.625 | 7.67 |
| 44573.635416666664 | 7.64 |
| 44573.645833333336 | 7.63 |
| 44573.65625 | 7.82 |
| 44573.666666666664 | 7.81 |
| 44573.677083333336 | 7.05 |
| 44573.6875 | 6.88 |
| 44573.697916666664 | 7.05 |
| 44573.708333333336 | 7.19 |
| 44573.71875 | 7.06 |
| 44573.729166666664 | 7.87 |
| 44573.739583333336 | 7.97 |
| 44573.75 | 8.4 |
| 44573.760416666664 | 9.12 |
| 44573.770833333336 | 11.96 |
| 44573.78125 | 11.48 |
| 44573.791666666664 | 10.45 |
| 44573.802083333336 | 10.58 |
| 44573.8125 | 10.57 |
| 44573.822916666664 | 9.96 |
| 44573.833333333336 | 9.57 |
| 44573.84375 | 9.53 |
| 44573.854166666664 | 8.78 |
| 44573.864583333336 | 8.63 |
| 44573.875 | 8.19 |
| 44573.885416666664 | 7.45 |
| 44573.895833333336 | 7.83 |
| 44573.90625 | 7.43 |
| 44573.916666666664 | 7.12 |
| 44573.927083333336 | 7.24 |
| 44573.9375 | 6.78 |
| 44573.947916666664 | 6.79 |
| 44573.958333333336 | 6.56 |
| 44573.96875 | 6.67 |
| 44573.979166666664 | 6.72 |
| 44573.989583333336 | 7.28 |
| 44574.0 | 7.59 |
| 44574.010416666664 | 7.91 |
| 44574.020833333336 | 8.38 |
| 44574.03125 | 8.69 |
| 44574.041666666664 | 9.16 |
| 44574.052083333336 | 8.83 |
| 44574.0625 | 8.57 |
| 44574.072916666664 | 8.59 |
| 44574.083333333336 | 8.5 |
| 44574.09375 | 8.38 |
| 44574.104166666664 | 8.7 |
| 44574.114583333336 | 8.59 |
| 44574.125 | 8.44 |
| 44574.135416666664 | 8.34 |
| 44574.145833333336 | 7.44 |
| 44574.15625 | 8.41 |
| 44574.166666666664 | 7.79 |
| 44574.177083333336 | 7.2 |
| 44574.1875 | 7.2 |
| 44574.197916666664 | 7.06 |
| 44574.208333333336 | 7.14 |
| 44574.21875 | 7.07 |
| 44574.229166666664 | 7.09 |
| 44574.239583333336 | 7.66 |
| 44574.25 | 8.23 |
| 44574.260416666664 | 8.19 |
| 44574.270833333336 | 8.21 |
| 44574.28125 | 8.07 |
| 44574.291666666664 | 7.19 |
| 44574.302083333336 | 6.79 |
| 44574.3125 | 6.45 |
| 44574.322916666664 | 5.88 |
| 44574.333333333336 | 5.69 |
| 44574.34375 | 5.9 |
| 44574.354166666664 | 5.48 |
| 44574.364583333336 | 5.6 |
| 44574.375 | 5.15 |
| 44574.385416666664 | 5.03 |
| 44574.395833333336 | 5.19 |
| 44574.40625 | 4.86 |
| 44574.416666666664 | 4.73 |
| 44574.427083333336 | 4.8 |
| 44574.4375 | 4.69 |
| 44574.447916666664 | 4.52 |
| 44574.458333333336 | 4.82 |
| 44574.46875 | 4.66 |
| 44574.479166666664 | 4.7 |
| 44574.489583333336 | 4.62 |
| 44574.5 | 4.47 |
| 44574.510416666664 | 4.8 |
| 44574.520833333336 | 4.92 |
| 44574.53125 | 4.89 |
| 44574.541666666664 | 5.21 |
| 44574.552083333336 | 5.82 |
| 44574.5625 | 6.28 |
| 44574.572916666664 | 7.43 |
| 44574.583333333336 | 7.94 |
| 44574.59375 | 7.48 |
| 44574.604166666664 | 7.51 |
| 44574.614583333336 | 7.76 |
| 44574.625 | 7.22 |
| 44574.635416666664 | 7.04 |
| 44574.645833333336 | 6.59 |
| 44574.65625 | 7.06 |
| 44574.666666666664 | 6.92 |
| 44574.677083333336 | 6.95 |
| 44574.6875 | 6.82 |
| 44574.697916666664 | 6.42 |
| 44574.708333333336 | 6.62 |
| 44574.71875 | 6.12 |
| 44574.729166666664 | 6.8 |
| 44574.739583333336 | 6.7 |
| 44574.75 | 6.31 |
| 44574.760416666664 | 6.27 |
| 44574.770833333336 | 6.18 |
| 44574.78125 | 6.09 |
| 44574.791666666664 | 5.72 |
| 44574.802083333336 | 5.63 |
| 44574.8125 | 5.56 |
| 44574.822916666664 | 5.23 |
| 44574.833333333336 | 5.03 |
| 44574.84375 | 4.79 |
| 44574.854166666664 | 4.55 |
| 44574.864583333336 | 4.44 |
| 44574.875 | 4.59 |
| 44574.885416666664 | 4.19 |
| 44574.895833333336 | 4.12 |
| 44574.90625 | 4.14 |
| 44574.916666666664 | 4.11 |
| 44574.927083333336 | 3.96 |
| 44574.9375 | 4.09 |
| 44574.947916666664 | 4.32 |
| 44574.958333333336 | 4.29 |
| 44574.96875 | 4.35 |
| 44574.979166666664 | 4.2 |
| 44574.989583333336 | 4.22 |
| 44575.0 | 4.13 |
| 44575.010416666664 | 4.16 |
| 44575.020833333336 | 4.21 |
| 44575.03125 | 4.26 |
| 44575.041666666664 | 4.51 |
| 44575.052083333336 | 4.57 |
| 44575.0625 | 4.52 |
| 44575.072916666664 | 5.12 |
| 44575.083333333336 | 5.47 |
| 44575.09375 | 5.91 |
| 44575.104166666664 | 6.18 |
| 44575.114583333336 | 6.15 |
| 44575.125 | 6.4 |
| 44575.135416666664 | 6.52 |
| 44575.145833333336 | 6.42 |
| 44575.15625 | 6.34 |
| 44575.166666666664 | 6.31 |
| 44575.177083333336 | 5.95 |
| 44575.1875 | 5.69 |
| 44575.197916666664 | 6.24 |
| 44575.208333333336 | 5.71 |
| 44575.21875 | 5.6 |
| 44575.229166666664 | 5.69 |
| 44575.239583333336 | 5.54 |
| 44575.25 | 5.61 |
| 44575.260416666664 | 5.55 |
| 44575.270833333336 | 5.59 |
| 44575.28125 | 5.45 |
| 44575.291666666664 | 4.96 |
| 44575.302083333336 | 4.85 |
| 44575.3125 | 4.68 |
| 44575.322916666664 | 4.58 |
| 44575.333333333336 | 4.54 |
| 44575.34375 | 4.5 |
| 44575.354166666664 | 4.14 |
| 44575.364583333336 | 3.92 |
| 44575.375 | 4.18 |
| 44575.385416666664 | 3.89 |
| 44575.395833333336 | 3.78 |
| 44575.40625 | 3.8 |
| 44575.416666666664 | 3.92 |
| 44575.427083333336 | 3.76 |
| 44575.4375 | 3.74 |
| 44575.447916666664 | 3.91 |
| 44575.458333333336 | 3.84 |
| 44575.46875 | 3.79 |
| 44575.479166666664 | 3.9 |
| 44575.489583333336 | 5.64 |
| 44575.5 | 3.77 |
| 44575.510416666664 | 3.9 |
| 44575.520833333336 | 3.92 |
| 44575.53125 | 3.83 |
| 44575.541666666664 | 3.73 |
| 44575.552083333336 | 3.8 |
| 44575.5625 | 3.98 |
| 44575.572916666664 | 3.98 |
| 44575.583333333336 | 3.97 |
| 44575.59375 | 3.98 |
| 44575.604166666664 | 4.1 |
| 44575.614583333336 | 4.18 |
| 44575.625 | 4.38 |
| 44575.635416666664 | 4.48 |
| 44575.645833333336 | 4.22 |
| 44575.65625 | 5.03 |
| 44575.666666666664 | 4.54 |
| 44575.677083333336 | 4.64 |
| 44575.6875 | 5.05 |
| 44575.697916666664 | 5.66 |
| 44575.708333333336 | 5.56 |
| 44575.71875 | 5.91 |
| 44575.729166666664 | 5.97 |
| 44575.739583333336 | 6.32 |
| 44575.75 | 5.53 |
| 44575.760416666664 | 5.68 |
| 44575.770833333336 | 5.69 |
| 44575.78125 | 5.63 |
| 44575.791666666664 | 5.14 |
| 44575.802083333336 | 5.03 |
| 44575.8125 | 4.84 |
| 44575.822916666664 | 4.72 |
| 44575.833333333336 | 4.52 |
| 44575.84375 | 4.65 |
| 44575.854166666664 | 4.48 |
| 44575.864583333336 | 4.51 |
| 44575.875 | 4.44 |
| 44575.885416666664 | 4.16 |
| 44575.895833333336 | 4.14 |
| 44575.90625 | 4.27 |
| 44575.916666666664 | 4.18 |
| 44575.927083333336 | 4.23 |
| 44575.9375 | 4.27 |
| 44575.947916666664 | 4.14 |
| 44575.958333333336 | 4.08 |
| 44575.96875 | 4.12 |
| 44575.979166666664 | 4.17 |
| 44575.989583333336 | 4.2 |
| 44576.0 | 4.15 |
| 44576.010416666664 | 4.22 |
| 44576.020833333336 | 4.1 |
| 44576.03125 | 4.24 |
| 44576.041666666664 | 3.99 |
| 44576.052083333336 | 4.06 |
| 44576.0625 | 4.28 |
| 44576.072916666664 | 4.66 |
| 44576.083333333336 | 4.46 |
| 44576.09375 | 4.54 |
| 44576.104166666664 | 4.58 |
| 44576.114583333336 | 5.5 |
| 44576.125 | 6.11 |
| 44576.135416666664 | 5.59 |
| 44576.145833333336 | 6.64 |
| 44576.15625 | 7.14 |
| 44576.166666666664 | 8.56 |
| 44576.177083333336 | 10.18 |
| 44576.1875 | 11.04 |
| 44576.197916666664 | 11.19 |
| 44576.208333333336 | 11.97 |
| 44576.21875 | 12.89 |
| 44576.229166666664 | 11.77 |
| 44576.239583333336 | 10.99 |
| 44576.25 | 9.21 |
| 44576.260416666664 | 9.42 |
| 44576.270833333336 | 8.76 |
| 44576.28125 | 8.88 |
| 44576.291666666664 | 7.93 |
| 44576.302083333336 | 7.35 |
| 44576.3125 | 7.83 |
| 44576.322916666664 | 7.2 |
| 44576.333333333336 | 6.98 |
| 44576.34375 | 6.63 |
| 44576.354166666664 | 6.21 |
| 44576.364583333336 | 6.07 |
| 44576.375 | 5.99 |
| 44576.385416666664 | 5.69 |
| 44576.395833333336 | 5.76 |
| 44576.40625 | 5.46 |
| 44576.416666666664 | 5.75 |
| 44576.427083333336 | 6.11 |
| 44576.4375 | 6.37 |
| 44576.447916666664 | 6.47 |
| 44576.458333333336 | 6.42 |
| 44576.46875 | 6.71 |
| 44576.479166666664 | 6.27 |
| 44576.489583333336 | 6.3 |
| 44576.5 | 6.33 |
| 44576.510416666664 | 6.22 |
| 44576.520833333336 | 6.13 |
| 44576.53125 | 5.67 |
| 44576.541666666664 | 6.01 |
| 44576.552083333336 | 5.7 |
| 44576.5625 | 5.62 |
| 44576.572916666664 | 5.55 |
| 44576.583333333336 | 5.28 |
| 44576.59375 | 5.22 |
| 44576.604166666664 | 5.69 |
| 44576.614583333336 | 5.07 |
| 44576.625 | 5.2 |
| 44576.635416666664 | 5.28 |
| 44576.645833333336 | 5.18 |
| 44576.65625 | 5.01 |
| 44576.666666666664 | 5.17 |
| 44576.677083333336 | 8.98 |
| 44576.6875 | 9.01 |
| 44576.697916666664 | 8.68 |
| 44576.708333333336 | 10.32 |
| 44576.71875 | 8.39 |
| 44576.729166666664 | 9.04 |
| 44576.739583333336 | 10.25 |
| 44576.75 | 11.84 |
| 44576.760416666664 | 10.65 |
| 44576.770833333336 | 10.74 |
| 44576.78125 | 8.65 |
| 44576.791666666664 | 7.98 |
| 44576.802083333336 | 7.68 |
| 44576.8125 | 7.88 |
| 44576.822916666664 | 7.61 |
| 44576.833333333336 | 7.18 |
| 44576.84375 | 7.02 |
| 44576.854166666664 | 7.01 |
| 44576.864583333336 | 6.27 |
| 44576.875 | 5.98 |
| 44576.885416666664 | 6.04 |
| 44576.895833333336 | 5.49 |
| 44576.90625 | 5.45 |
| 44576.916666666664 | 5.25 |
| 44576.927083333336 | 5.61 |
| 44576.9375 | 5.54 |
| 44576.947916666664 | 5.52 |
| 44576.958333333336 | 5.13 |
| 44576.96875 | 4.96 |
| 44576.979166666664 | 4.82 |
| 44576.989583333336 | 4.87 |
| 44577.0 | 4.91 |
| 44577.010416666664 | 4.82 |
| 44577.020833333336 | 4.86 |
| 44577.03125 | 4.75 |
| 44577.041666666664 | 4.77 |
| 44577.052083333336 | 4.83 |
| 44577.0625 | 4.86 |
| 44577.072916666664 | 4.8 |
| 44577.083333333336 | 4.82 |
| 44577.09375 | 4.66 |
| 44577.104166666664 | 4.7 |
| 44577.114583333336 | 4.56 |
| 44577.125 | 4.77 |
| 44577.135416666664 | 5.14 |
| 44577.145833333336 | 5.12 |
| 44577.15625 | 5.34 |
| 44577.166666666664 | 5.26 |
| 44577.177083333336 | 6.06 |
| 44577.1875 | 6.07 |
| 44577.197916666664 | 6.37 |
| 44577.208333333336 | 6.53 |
| 44577.21875 | 6.84 |
| 44577.229166666664 | 6.8 |
| 44577.239583333336 | 6.51 |
| 44577.25 | 6.5 |
| 44577.260416666664 | 6.29 |
| 44577.270833333336 | 5.98 |
| 44577.28125 | 6.14 |
| 44577.291666666664 | 6.41 |
| 44577.302083333336 | 5.89 |
| 44577.3125 | 5.7 |
| 44577.322916666664 | 5.94 |
| 44577.333333333336 | 5.39 |
| 44577.34375 | 5.29 |
| 44577.354166666664 | 5.23 |
| 44577.364583333336 | 5.34 |
| 44577.375 | 5.19 |
| 44577.385416666664 | 5.19 |
| 44577.395833333336 | 5.18 |
| 44577.40625 | 5 |
| 44577.416666666664 | 4.84 |
| 44577.427083333336 | 4.75 |
| 44577.4375 | 4.4 |
| 44577.447916666664 | 4.47 |
| 44577.458333333336 | 4.26 |
| 44577.46875 | 4.34 |
| 44577.479166666664 | 4.24 |
| 44577.489583333336 | 4.38 |
| 44577.5 | 4.4 |
| 44577.510416666664 | 4.47 |
| 44577.520833333336 | 4.57 |
| 44577.53125 | 4.73 |
| 44577.541666666664 | 4.49 |
| 44577.552083333336 | 4.56 |
| 44577.5625 | 4.44 |
| 44577.572916666664 | 4.36 |
| 44577.583333333336 | 4.42 |
| 44577.59375 | 4.4 |
| 44577.604166666664 | 4.33 |
| 44577.614583333336 | 4.27 |
| 44577.625 | 4.56 |
| 44577.635416666664 | 4.37 |
| 44577.645833333336 | 4.31 |
| 44577.65625 | 4.26 |
| 44577.666666666664 | 4.4 |
| 44577.677083333336 | 4.89 |
| 44577.6875 | 5.08 |
| 44577.697916666664 | 5.13 |
| 44577.708333333336 | 5.63 |
| 44577.71875 | 6.68 |
| 44577.729166666664 | 6.4 |
| 44577.739583333336 | 7.97 |
| 44577.75 | 8.27 |
| 44577.760416666664 | 8.9 |
| 44577.770833333336 | 9.11 |
| 44577.78125 | 8.89 |
| 44577.791666666664 | 8.42 |
| 44577.802083333336 | 8.18 |
| 44577.8125 | 8.25 |
| 44577.822916666664 | 7.89 |
| 44577.833333333336 | 7.59 |
| 44577.84375 | 7.29 |
| 44577.854166666664 | 7.29 |
| 44577.864583333336 | 7.16 |
| 44577.875 | 7.13 |
| 44577.885416666664 | 6.64 |
| 44577.895833333336 | 6.51 |
| 44577.90625 | 6.28 |
| 44577.916666666664 | 6.53 |
| 44577.927083333336 | 6.88 |
| 44577.9375 | 7.38 |
| 44577.947916666664 | 7.69 |
| 44577.958333333336 | 7.87 |
| 44577.96875 | 7.74 |
| 44577.979166666664 | 7.66 |
| 44577.989583333336 | 7.09 |
| 44578.0 | 6.84 |
| 44578.010416666664 | 6.37 |
| 44578.020833333336 | 6.09 |
| 44578.03125 | 6.07 |
| 44578.041666666664 | 6.86 |
| 44578.052083333336 | 7.33 |
| 44578.0625 | 7.74 |
| 44578.072916666664 | 8.18 |
| 44578.083333333336 | 8.72 |
| 44578.09375 | 8.77 |
| 44578.104166666664 | 8.97 |
| 44578.114583333336 | 9.17 |
| 44578.125 | 10.32 |
| 44578.135416666664 | 10.84 |
| 44578.145833333336 | 10.19 |
| 44578.15625 | 10.56 |
| 44578.166666666664 | 12.93 |
| 44578.177083333336 | 12.91 |
| 44578.1875 | 11.85 |
| 44578.197916666664 | 11.52 |
| 44578.208333333336 | 11.96 |
| 44578.21875 | 13.7 |
| 44578.229166666664 | 17.24 |
| 44578.239583333336 | 22.87 |
| 44578.25 | 21.41 |
| 44578.260416666664 | 30.53 |
| 44578.270833333336 | 32.85 |
| 44578.28125 | 34.32 |
| 44578.291666666664 | 43.43 |
| 44578.302083333336 | 35.68 |
| 44578.3125 | 32.18 |
| 44578.322916666664 | 24.61 |
| 44578.333333333336 | 26.18 |
| 44578.34375 | 33.28 |
| 44578.354166666664 | 33.88 |
| 44578.364583333336 | 39.07 |
| 44578.375 | 44.19 |
| 44578.385416666664 | 44.04 |
| 44578.395833333336 | 40.02 |
| 44578.40625 | 42.09 |
| 44578.416666666664 | 52.32 |
| 44578.427083333336 | 54.81 |
| 44578.4375 | 50.76 |
| 44578.447916666664 | 47.27 |
| 44578.458333333336 | 43.16 |
| 44578.46875 | 35.29 |
| 44578.479166666664 | 28.97 |
| 44578.489583333336 | 22.41 |
| 44578.5 | 22.18 |
| 44578.510416666664 | 20.33 |
| 44578.520833333336 | 21.46 |
| 44578.53125 | 20.2 |
| 44578.541666666664 | 19.6 |
| 44578.552083333336 | 18.22 |
| 44578.5625 | 17.31 |
| 44578.572916666664 | 18.3 |
| 44578.583333333336 | 17.03 |
| 44578.59375 | 16.3 |
| 44578.604166666664 | 15.66 |
| 44578.614583333336 | 17.26 |
| 44578.625 | 16.73 |
| 44578.635416666664 | 15.4 |
| 44578.645833333336 | 16.59 |
| 44578.65625 | 15.38 |
| 44578.666666666664 | 17.12 |
| 44578.677083333336 | 20.35 |
| 44578.6875 | 25.26 |
| 44578.697916666664 | 32.01 |
| 44578.708333333336 | 45.1 |
| 44578.71875 | 40.9 |
| 44578.729166666664 | 53.44 |
| 44578.739583333336 | 49.83 |
| 44578.75 | 51.08 |
| 44578.760416666664 | 41.86 |
| 44578.770833333336 | 32.88 |
| 44578.78125 | 29.12 |
| 44578.791666666664 | 28.77 |
| 44578.802083333336 | 25.96 |
| 44578.8125 | 23.83 |
| 44578.822916666664 | 23.58 |
| 44578.833333333336 | 20.85 |
| 44578.84375 | 19.11 |
| 44578.854166666664 | 18.94 |
| 44578.864583333336 | 19.12 |
| 44578.875 | 18.18 |
| 44578.885416666664 | 45.07 |
| 44578.895833333336 | 42.25 |
| 44578.90625 | 39.23 |
| 44578.916666666664 | 35.35 |
| 44578.927083333336 | 34.44 |
| 44578.9375 | 38.66 |
| 44578.947916666664 | 35.29 |
| 44578.958333333336 | 35.52 |
| 44578.96875 | 40.55 |
| 44578.979166666664 | 39.5 |
| 44578.989583333336 | 39.17 |
| 44579.0 | 36.84 |
| 44579.010416666664 | 50.02 |
| 44579.020833333336 | 39.63 |
| 44579.03125 | 37.32 |
| 44579.041666666664 | 32.84 |
| 44579.052083333336 | 31.34 |
| 44579.0625 | 25.46 |
| 44579.072916666664 | 21.16 |
| 44579.083333333336 | 19.7 |
| 44579.09375 | 19.48 |
| 44579.104166666664 | 20.84 |
| 44579.114583333336 | 22.33 |
| 44579.125 | 28.11 |
| 44579.135416666664 | 25.54 |
| 44579.145833333336 | 31.61 |
| 44579.15625 | 29.85 |
| 44579.166666666664 | 27.25 |
| 44579.177083333336 | 27.95 |
| 44579.1875 | 27.52 |
| 44579.197916666664 | 23.9 |
| 44579.208333333336 | 19.74 |
| 44579.21875 | 17.47 |
| 44579.229166666664 | 19.84 |
| 44579.239583333336 | 19 |
| 44579.25 | 19.83 |
| 44579.260416666664 | 21.08 |
| 44579.270833333336 | 23.11 |
| 44579.28125 | 17.33 |
| 44579.291666666664 | 15.94 |
| 44579.302083333336 | 16.95 |
| 44579.3125 | 18.91 |
| 44579.322916666664 | 17.38 |
| 44579.333333333336 | 15.32 |
| 44579.34375 | 14.69 |
| 44579.354166666664 | 14.73 |
| 44579.364583333336 | 15.78 |
| 44579.375 | 16.34 |
| 44579.385416666664 | 30.4 |
| 44579.395833333336 | 33.91 |
| 44579.40625 | 37.87 |
| 44579.416666666664 | 34.78 |
| 44579.427083333336 | 35.09 |
| 44579.4375 | 30.12 |
| 44579.447916666664 | 25.53 |
| 44579.458333333336 | 23.81 |
| 44579.46875 | 23.58 |
| 44579.479166666664 | 26.36 |
| 44579.489583333336 | 28.18 |
| 44579.5 | 28.6 |
| 44579.510416666664 | 29.74 |
| 44579.520833333336 | 26.55 |
| 44579.53125 | 25.74 |
| 44579.541666666664 | 23.29 |
| 44579.552083333336 | 22.65 |
| 44579.5625 | 24.64 |
| 44579.572916666664 | 19.51 |
| 44579.583333333336 | 17.16 |
| 44579.59375 | 16.72 |
| 44579.604166666664 | 13.24 |
| 44579.614583333336 | 14.34 |
| 44579.625 | 13.32 |
| 44579.635416666664 | 13.07 |
| 44579.645833333336 | 13.59 |
| 44579.65625 | 15.89 |
| 44579.666666666664 | 22.44 |
| 44579.677083333336 | 23.3 |
| 44579.6875 | 26.35 |
| 44579.697916666664 | 29.02 |
| 44579.708333333336 | 30.34 |
| 44579.71875 | 29.06 |
| 44579.729166666664 | 29.36 |
| 44579.739583333336 | 29.35 |
| 44579.75 | 28.25 |
| 44579.760416666664 | 26.04 |
| 44579.770833333336 | 22.92 |
| 44579.78125 | 23.74 |
| 44579.791666666664 | 21.13 |
| 44579.802083333336 | 21.64 |
| 44579.8125 | 18.93 |
| 44579.822916666664 | 15.69 |
| 44579.833333333336 | 15.82 |
| 44579.84375 | 15.3 |
| 44579.854166666664 | 14.22 |
| 44579.864583333336 | 13.16 |
| 44579.875 | 14.82 |
| 44579.885416666664 | 13.25 |
| 44579.895833333336 | 13.77 |
| 44579.90625 | 20.81 |
| 44579.916666666664 | 18.93 |
| 44579.927083333336 | 17.24 |
| 44579.9375 | 16.05 |
| 44579.947916666664 | 16.44 |
| 44579.958333333336 | 16.89 |
| 44579.96875 | 15.2 |
| 44579.979166666664 | 14.71 |
| 44579.989583333336 | 17.06 |
| 44580.0 | 14.91 |
| 44580.010416666664 | 12.48 |
| 44580.020833333336 | 14.39 |
| 44580.03125 | 13.17 |
| 44580.041666666664 | 14.58 |
| 44580.052083333336 | 11.43 |
| 44580.0625 | 10.88 |
| 44580.072916666664 | 10.83 |
| 44580.083333333336 | 9.51 |
| 44580.09375 | 9.68 |
| 44580.104166666664 | 9.51 |
| 44580.114583333336 | 9.37 |
| 44580.125 | 9.06 |
| 44580.135416666664 | 9.14 |
| 44580.145833333336 | 9.49 |
| 44580.15625 | 9.01 |
| 44580.166666666664 | 9.58 |
| 44580.177083333336 | 11.43 |
| 44580.1875 | 12.84 |
| 44580.197916666664 | 14 |
| 44580.208333333336 | 15.35 |
| 44580.21875 | 15.75 |
| 44580.229166666664 | 14.31 |
| 44580.239583333336 | 14.06 |
| 44580.25 | 13.47 |
| 44580.260416666664 | 13.17 |
| 44580.270833333336 | 13.34 |
| 44580.28125 | 13.4 |
| 44580.291666666664 | 12.77 |
| 44580.302083333336 | 12.37 |
| 44580.3125 | 10.98 |
| 44580.322916666664 | 10.89 |
| 44580.333333333336 | 10.84 |
| 44580.34375 | 10.09 |
| 44580.354166666664 | 10.18 |
| 44580.364583333336 | 10.85 |
| 44580.375 | 11.37 |
| 44580.385416666664 | 11.81 |
| 44580.395833333336 | 11.45 |
| 44580.40625 | 13.52 |
| 44580.416666666664 | 13.47 |
| 44580.427083333336 | 12.11 |
| 44580.4375 | 12.12 |
| 44580.447916666664 | 10.61 |
| 44580.458333333336 | 9.6 |
| 44580.46875 | 8.83 |
| 44580.479166666664 | 8.67 |
| 44580.489583333336 | 8.21 |
| 44580.5 | 7.94 |
| 44580.510416666664 | 8.03 |
| 44580.520833333336 | 8.08 |
| 44580.53125 | 7.94 |
| 44580.541666666664 | 7.62 |
| 44580.552083333336 | 7.32 |
| 44580.5625 | 7.37 |
| 44580.572916666664 | 7.15 |
| 44580.583333333336 | 7.41 |
| 44580.59375 | 7.45 |
| 44580.604166666664 | 7.06 |
| 44580.614583333336 | 7.06 |
| 44580.625 | 8.97 |
| 44580.635416666664 | 6.49 |
| 44580.645833333336 | 6.26 |
| 44580.65625 | 6.18 |
| 44580.666666666664 | 6.64 |
| 44580.677083333336 | 6.57 |
| 44580.6875 | 7.23 |
| 44580.697916666664 | 8.04 |
| 44580.708333333336 | 10.66 |
| 44580.71875 | 11.6 |
| 44580.729166666664 | 15.12 |
| 44580.739583333336 | 18.23 |
| 44580.75 | 20.06 |
| 44580.760416666664 | 15.8 |
| 44580.770833333336 | 18.51 |
| 44580.78125 | 19.12 |
| 44580.791666666664 | 18.95 |
| 44580.802083333336 | 18.32 |
| 44580.8125 | 19.55 |
| 44580.833333333336 | 18.78 |
| 44580.84375 | 22.64 |
| 44580.854166666664 | 18.49 |
| 44580.864583333336 | 17.18 |
| 44580.875 | 15.61 |
| 44580.885416666664 | 14.73 |
| 44580.895833333336 | 15.35 |
| 44580.90625 | 19.09 |
| 44580.916666666664 | 16.25 |
| 44580.927083333336 | 14.93 |
| 44580.9375 | 16.37 |
| 44580.947916666664 | 16.72 |
| 44580.958333333336 | 17 |
| 44580.96875 | 15.85 |
| 44580.979166666664 | 15.62 |
| 44580.989583333336 | 15.7 |
| 44581.0 | 15.72 |
| 44581.010416666664 | 16.13 |
| 44581.020833333336 | 16.62 |
| 44581.03125 | 15.89 |
| 44581.041666666664 | 16.28 |
| 44581.052083333336 | 16.43 |
| 44581.0625 | 14 |
| 44581.072916666664 | 14.18 |
| 44581.083333333336 | 13.65 |
| 44581.09375 | 13.08 |
| 44581.104166666664 | 12.07 |
| 44581.114583333336 | 12.85 |
| 44581.125 | 10.55 |
| 44581.135416666664 | 10.8 |
| 44581.145833333336 | 10.1 |
| 44581.15625 | 10.21 |
| 44581.166666666664 | 9.44 |
| 44581.177083333336 | 9.94 |
| 44581.1875 | 9.93 |
| 44581.197916666664 | 10.96 |
| 44581.208333333336 | 11.32 |
| 44581.21875 | 10.97 |
| 44581.229166666664 | 12.91 |
| 44581.239583333336 | 13.24 |
| 44581.25 | 15.32 |
| 44581.260416666664 | 14.4 |
| 44581.270833333336 | 13.56 |
| 44581.28125 | 13.66 |
| 44581.291666666664 | 14.13 |
| 44581.302083333336 | 14.28 |
| 44581.3125 | 14.88 |
| 44581.322916666664 | 14.69 |
| 44581.333333333336 | 13.98 |
| 44581.34375 | 13.87 |
| 44581.354166666664 | 12.47 |
| 44581.364583333336 | 11.94 |
| 44581.375 | 11.55 |
| 44581.385416666664 | 11.9 |
| 44581.395833333336 | 12.22 |
| 44581.40625 | 12.69 |
| 44581.416666666664 | 12.27 |
| 44581.427083333336 | 13.23 |
| 44581.4375 | 13.17 |
| 44581.447916666664 | 12.92 |
| 44581.458333333336 | 12.42 |
| 44581.46875 | 11.4 |
| 44581.479166666664 | 10.37 |
| 44581.489583333336 | 9.69 |
| 44581.5 | 9.38 |
| 44581.510416666664 | 9.41 |
| 44581.520833333336 | 9.37 |
| 44581.53125 | 9.69 |
| 44581.541666666664 | 9.63 |
| 44581.552083333336 | 8.99 |
| 44581.5625 | 8.71 |
| 44581.572916666664 | 8.09 |
| 44581.583333333336 | 7.95 |
| 44581.59375 | 7.54 |
| 44581.604166666664 | 7.23 |
| 44581.614583333336 | 7.04 |
| 44581.625 | 7.05 |
| 44581.635416666664 | 7.12 |
| 44581.645833333336 | 7.22 |
| 44581.65625 | 6.57 |
| 44581.666666666664 | 6.3 |
| 44581.677083333336 | 6.15 |
| 44581.6875 | 6.45 |
| 44581.697916666664 | 6.47 |
| 44581.708333333336 | 7.12 |
| 44581.71875 | 8.05 |
| 44581.729166666664 | 8.72 |
| 44581.739583333336 | 10.62 |
| 44581.75 | 16.52 |
| 44581.760416666664 | 17.05 |
| 44581.770833333336 | 15.42 |
| 44581.78125 | 18.52 |
| 44581.791666666664 | 16.46 |
| 44581.802083333336 | 15.44 |
| 44581.8125 | 14.54 |
| 44581.822916666664 | 13.86 |
| 44581.833333333336 | 14 |
| 44581.84375 | 13.54 |
| 44581.854166666664 | 13.15 |
| 44581.864583333336 | 12.92 |
| 44581.875 | 11.28 |
| 44581.885416666664 | 12.17 |
| 44581.895833333336 | 10.9 |
| 44581.90625 | 10.89 |
| 44581.916666666664 | 11.26 |
| 44581.927083333336 | 10.79 |
| 44581.9375 | 10.48 |
| 44581.947916666664 | 12.67 |
| 44581.958333333336 | 11.44 |
| 44581.96875 | 10.3 |
| 44581.979166666664 | 10.67 |
| 44581.989583333336 | 10.55 |
| 44582.0 | 9.83 |
| 44582.010416666664 | 9.17 |
| 44582.020833333336 | 8.78 |
| 44582.03125 | 8.24 |
| 44582.041666666664 | 8.25 |
| 44582.052083333336 | 7.78 |
| 44582.0625 | 7.66 |
| 44582.072916666664 | 7.86 |
| 44582.083333333336 | 7.87 |
| 44582.09375 | 7.98 |
| 44582.104166666664 | 7.77 |
| 44582.114583333336 | 7.5 |
| 44582.125 | 7.07 |
| 44582.135416666664 | 7.16 |
| 44582.145833333336 | 7.22 |
| 44582.15625 | 6.73 |
| 44582.166666666664 | 6.76 |
| 44582.177083333336 | 6.43 |
| 44582.1875 | 5.75 |
| 44582.197916666664 | 6.25 |
| 44582.208333333336 | 6.57 |
| 44582.21875 | 6.51 |
| 44582.229166666664 | 7.28 |
| 44582.239583333336 | 7.08 |
| 44582.25 | 8.1 |
| 44582.260416666664 | 7.95 |
| 44582.270833333336 | 9.92 |
| 44582.28125 | 12.83 |
| 44582.291666666664 | 14.24 |
| 44582.302083333336 | 15.63 |
| 44582.3125 | 14.53 |
| 44582.322916666664 | 24.85 |
| 44582.333333333336 | 13.86 |
| 44582.34375 | 13.08 |
| 44582.354166666664 | 12.56 |
| 44582.364583333336 | 13.5 |
| 44582.375 | 13.25 |
| 44582.385416666664 | 13.13 |
| 44582.395833333336 | 12.27 |
| 44582.40625 | 11.6 |
| 44582.416666666664 | 10.98 |
| 44582.427083333336 | 10.56 |
| 44582.4375 | 10.78 |
| 44582.447916666664 | 11.04 |
| 44582.458333333336 | 10.48 |
| 44582.46875 | 10.89 |
| 44582.479166666664 | 10.75 |
| 44582.489583333336 | 10.2 |
| 44582.5 | 10 |
| 44582.510416666664 | 9.96 |
| 44582.520833333336 | 9.68 |
| 44582.53125 | 9.23 |
| 44582.541666666664 | 8.99 |
| 44582.552083333336 | 9.02 |
| 44582.5625 | 9.36 |
| 44582.572916666664 | 9.38 |
| 44582.583333333336 | 9.18 |
| 44582.59375 | 8.99 |
| 44582.604166666664 | 8.75 |
| 44582.614583333336 | 8.79 |
| 44582.625 | 7.98 |
| 44582.635416666664 | 8.26 |
| 44582.645833333336 | 7.63 |
| 44582.65625 | 7.7 |
| 44582.666666666664 | 8.03 |
| 44582.677083333336 | 7.63 |
| 44582.6875 | 7.93 |
| 44582.697916666664 | 8.23 |
| 44582.708333333336 | 6.94 |
| 44582.71875 | 6.82 |
| 44582.729166666664 | 6.72 |
| 44582.739583333336 | 6.56 |
| 44582.75 | 6.54 |
| 44582.760416666664 | 6.61 |
| 44582.770833333336 | 6.92 |
| 44582.78125 | 7.61 |
| 44582.791666666664 | 7.79 |
| 44582.802083333336 | 8.55 |
| 44582.8125 | 10.33 |
| 44582.822916666664 | 12.48 |
| 44582.833333333336 | 11.39 |
| 44582.84375 | 10.93 |
| 44582.854166666664 | 12.09 |
| 44582.864583333336 | 15.93 |
| 44582.875 | 15.79 |
| 44582.885416666664 | 15 |
| 44582.895833333336 | 13.98 |
| 44582.90625 | 11.93 |
| 44582.916666666664 | 12 |
| 44582.927083333336 | 12.35 |
| 44582.9375 | 11.3 |
| 44582.947916666664 | 11.15 |
| 44582.958333333336 | 10.68 |
| 44582.96875 | 11 |
| 44582.979166666664 | 10.73 |
| 44582.989583333336 | 10.53 |
| 44583.0 | 10.26 |
| 44583.010416666664 | 9.79 |
| 44583.020833333336 | 9.24 |
| 44583.03125 | 8.97 |
| 44583.041666666664 | 9.17 |
| 44583.052083333336 | 8.77 |
| 44583.0625 | 8.78 |
| 44583.072916666664 | 8.63 |
| 44583.083333333336 | 8.14 |
| 44583.09375 | 7.6 |
| 44583.104166666664 | 7.52 |
| 44583.114583333336 | 7.52 |
| 44583.125 | 7.41 |
| 44583.135416666664 | 7.25 |
| 44583.145833333336 | 7.22 |
| 44583.15625 | 7.24 |
| 44583.166666666664 | 7.27 |
| 44583.177083333336 | 7.28 |
| 44583.1875 | 6.93 |
| 44583.197916666664 | 6.75 |
| 44583.208333333336 | 6.82 |
| 44583.21875 | 6.3 |
| 44583.229166666664 | 6.34 |
| 44583.239583333336 | 6.11 |
| 44583.25 | 6.61 |
| 44583.260416666664 | 6.78 |
| 44583.270833333336 | 6.65 |
| 44583.28125 | 7.52 |
| 44583.291666666664 | 7.25 |
| 44583.302083333336 | 8.03 |
| 44583.3125 | 9.89 |
| 44583.322916666664 | 12.43 |
| 44583.333333333336 | 12 |
| 44583.34375 | 11.19 |
| 44583.354166666664 | 11.96 |
| 44583.364583333336 | 11.61 |
| 44583.375 | 12.04 |
| 44583.385416666664 | 12.22 |
| 44583.395833333336 | 11.58 |
| 44583.40625 | 12.83 |
| 44583.416666666664 | 12.83 |
| 44583.427083333336 | 11.79 |
| 44583.4375 | 10.9 |
| 44583.447916666664 | 10.23 |
| 44583.458333333336 | 9.34 |
| 44583.46875 | 10.26 |
| 44583.479166666664 | 9.61 |
| 44583.489583333336 | 9.96 |
| 44583.5 | 9.29 |
| 44583.510416666664 | 9.14 |
| 44583.520833333336 | 9.63 |
| 44583.53125 | 9.13 |
| 44583.541666666664 | 8.73 |
| 44583.552083333336 | 8.57 |
| 44583.5625 | 8.28 |
| 44583.572916666664 | 8 |
| 44583.583333333336 | 7.76 |
| 44583.59375 | 7.31 |
| 44583.604166666664 | 7.24 |
| 44583.614583333336 | 7.07 |
| 44583.625 | 7.03 |
| 44583.635416666664 | 7 |
| 44583.645833333336 | 7.15 |
| 44583.65625 | 7.06 |
| 44583.666666666664 | 6.74 |
| 44583.677083333336 | 6.73 |
| 44583.6875 | 6.5 |
| 44583.697916666664 | 6.6 |
| 44583.708333333336 | 6.44 |
| 44583.71875 | 6.32 |
| 44583.729166666664 | 6.15 |
| 44583.739583333336 | 5.74 |
| 44583.75 | 5.96 |
| 44583.760416666664 | 5.86 |
| 44583.770833333336 | 5.82 |
| 44583.78125 | 6 |
| 44583.791666666664 | 5.71 |
| 44583.802083333336 | 6.22 |
| 44583.8125 | 6.26 |
| 44583.822916666664 | 7.36 |
| 44583.833333333336 | 9.58 |
| 44583.84375 | 9.35 |
| 44583.854166666664 | 9.93 |
| 44583.864583333336 | 9.6 |
| 44583.875 | 8.85 |
| 44583.885416666664 | 8.61 |
| 44583.895833333336 | 9.71 |
| 44583.90625 | 10.16 |
| 44583.916666666664 | 9.92 |
| 44583.927083333336 | 10.04 |
| 44583.9375 | 9.96 |
| 44583.947916666664 | 7.87 |
| 44583.958333333336 | 9.29 |
| 44583.96875 | 8.39 |
| 44583.979166666664 | 8.94 |
| 44583.989583333336 | 8.66 |
| 44584.0 | 8.16 |
| 44584.010416666664 | 8.29 |
| 44584.020833333336 | 8.19 |
| 44584.03125 | 7.72 |
| 44584.041666666664 | 7.58 |
| 44584.052083333336 | 7.1 |
| 44584.0625 | 6.77 |
| 44584.072916666664 | 6.67 |
| 44584.083333333336 | 6.75 |
| 44584.09375 | 6.61 |
| 44584.104166666664 | 6.15 |
| 44584.114583333336 | 6 |
| 44584.125 | 5.91 |
| 44584.135416666664 | 5.83 |
| 44584.145833333336 | 5.68 |
| 44584.15625 | 5.54 |
| 44584.166666666664 | 5.39 |
| 44584.177083333336 | 5.42 |
| 44584.1875 | 5.45 |
| 44584.197916666664 | 5.25 |
| 44584.208333333336 | 5.09 |
| 44584.21875 | 5.36 |
| 44584.229166666664 | 5.18 |
| 44584.239583333336 | 5.41 |
| 44584.25 | 4.93 |
| 44584.260416666664 | 4.97 |
| 44584.270833333336 | 5.12 |
| 44584.28125 | 5.18 |
| 44584.291666666664 | 5.93 |
| 44584.302083333336 | 6.06 |
| 44584.3125 | 6.28 |
| 44584.322916666664 | 6.44 |
| 44584.333333333336 | 6.86 |
| 44584.34375 | 8.08 |
| 44584.354166666664 | 7.58 |
| 44584.364583333336 | 7.21 |
| 44584.375 | 8.19 |
| 44584.385416666664 | 8.11 |
| 44584.395833333336 | 8.22 |
| 44584.40625 | 7.99 |
| 44584.416666666664 | 7.77 |
| 44584.427083333336 | 8.2 |
| 44584.4375 | 7.66 |
| 44584.447916666664 | 7.84 |
| 44584.458333333336 | 7.4 |
| 44584.46875 | 7.82 |
| 44584.479166666664 | 7.34 |
| 44584.489583333336 | 7.52 |
| 44584.5 | 7.61 |
| 44584.510416666664 | 7.57 |
| 44584.520833333336 | 7.96 |
| 44584.53125 | 7.3 |
| 44584.541666666664 | 7.19 |
| 44584.552083333336 | 6.02 |
| 44584.5625 | 5.91 |
| 44584.572916666664 | 5.7 |
| 44584.583333333336 | 5.44 |
| 44584.59375 | 5.41 |
| 44584.604166666664 | 5.42 |
| 44584.614583333336 | 5.11 |
| 44584.625 | 5.01 |
| 44584.635416666664 | 4.99 |
| 44584.645833333336 | 4.87 |
| 44584.65625 | 4.73 |
| 44584.666666666664 | 4.86 |
| 44584.677083333336 | 5.15 |
| 44584.6875 | 4.92 |
| 44584.697916666664 | 5.04 |
| 44584.708333333336 | 5.01 |
| 44584.71875 | 4.7 |
| 44584.729166666664 | 4.53 |
| 44584.739583333336 | 4.32 |
| 44584.75 | 5.07 |
| 44584.760416666664 | 5.29 |
| 44584.770833333336 | 4.41 |
| 44584.78125 | 4.37 |
| 44584.791666666664 | 4.65 |
| 44584.802083333336 | 4.74 |
| 44584.8125 | 4.84 |
| 44584.822916666664 | 4.86 |
| 44584.833333333336 | 5.19 |
| 44584.84375 | 5.08 |
| 44584.854166666664 | 5.86 |
| 44584.864583333336 | 6.64 |
| 44584.875 | 6.86 |
| 44584.885416666664 | 6.66 |
| 44584.895833333336 | 6.49 |
| 44584.90625 | 7.06 |
| 44584.916666666664 | 6.57 |
| 44584.927083333336 | 6.74 |
| 44584.9375 | 6.81 |
| 44584.947916666664 | 6.19 |
| 44584.958333333336 | 6.5 |
| 44584.96875 | 6.37 |
| 44584.979166666664 | 6.28 |
| 44584.989583333336 | 7.04 |
| 44585.0 | 6.22 |
| 44585.010416666664 | 5.56 |
| 44585.020833333336 | 6.01 |
| 44585.03125 | 6.13 |
| 44585.041666666664 | 6.03 |
| 44585.052083333336 | 5.97 |
| 44585.0625 | 6.22 |
| 44585.072916666664 | 5.93 |
| 44585.083333333336 | 5.73 |
| 44585.09375 | 5.44 |
| 44585.104166666664 | 5.35 |
| 44585.114583333336 | 5.29 |
| 44585.125 | 5.19 |
| 44585.135416666664 | 4.91 |
| 44585.145833333336 | 4.89 |
| 44585.15625 | 4.68 |
| 44585.166666666664 | 4.78 |
| 44585.177083333336 | 4.64 |
| 44585.1875 | 4.55 |
| 44585.197916666664 | 4.66 |
| 44585.208333333336 | 4.5 |
| 44585.21875 | 4.36 |
| 44585.229166666664 | 4.57 |
| 44585.239583333336 | 4.5 |
| 44585.25 | 3.93 |
| 44585.260416666664 | 5.05 |
| 44585.270833333336 | 4.76 |
| 44585.28125 | 4.44 |
| 44585.291666666664 | 4.55 |
| 44585.302083333336 | 4.41 |
| 44585.3125 | 4.49 |
| 44585.322916666664 | 4.8 |
| 44585.333333333336 | 4.84 |
| 44585.34375 | 5.26 |
| 44585.354166666664 | 5.8 |
| 44585.364583333336 | 7.44 |
| 44585.375 | 7.82 |
| 44585.385416666664 | 7.7 |
| 44585.395833333336 | 7.18 |
| 44585.40625 | 7.23 |
| 44585.416666666664 | 7.07 |
| 44585.427083333336 | 7.1 |
| 44585.4375 | 6.7 |
| 44585.447916666664 | 6.67 |
| 44585.458333333336 | 6.31 |
| 44585.46875 | 6.41 |
| 44585.479166666664 | 6.57 |
| 44585.489583333336 | 6.11 |
| 44585.5 | 6.04 |
| 44585.510416666664 | 6.38 |
| 44585.520833333336 | 6.67 |
| 44585.53125 | 6.46 |
| 44585.541666666664 | 6.6 |
| 44585.552083333336 | 6.05 |
| 44585.5625 | 6.13 |
| 44585.572916666664 | 5.67 |
| 44585.583333333336 | 5.48 |
| 44585.59375 | 5.09 |
| 44585.604166666664 | 4.9 |
| 44585.614583333336 | 4.67 |
| 44585.625 | 4.7 |
| 44585.635416666664 | 4.73 |
| 44585.645833333336 | 4.59 |
| 44585.65625 | 4.5 |
| 44585.666666666664 | 4.48 |
| 44585.677083333336 | 4.34 |
| 44585.6875 | 4.32 |
| 44585.697916666664 | 4.31 |
| 44585.708333333336 | 4.29 |
| 44585.71875 | 4.19 |
| 44585.729166666664 | 4.14 |
| 44585.739583333336 | 4.5 |
| 44585.75 | 4.72 |
| 44585.760416666664 | 4.41 |
| 44585.770833333336 | 4.3 |
| 44585.78125 | 4.02 |
| 44585.791666666664 | 3.83 |
| 44585.802083333336 | 3.93 |
| 44585.8125 | 4.1 |
| 44585.822916666664 | 4.15 |
| 44585.833333333336 | 4.33 |
| 44585.84375 | 4.52 |
| 44585.854166666664 | 4.69 |
| 44585.864583333336 | 4.6 |
| 44585.875 | 4.94 |
| 44585.885416666664 | 5.29 |
| 44585.895833333336 | 5.7 |
| 44585.90625 | 5.84 |
| 44585.916666666664 | 6.01 |
| 44585.927083333336 | 6.11 |
| 44585.9375 | 6.13 |
| 44585.947916666664 | 6.03 |
| 44585.958333333336 | 5.84 |
| 44585.96875 | 5.99 |
| 44585.979166666664 | 5.73 |
| 44585.989583333336 | 5.84 |
| 44586.0 | 5.94 |
| 44586.010416666664 | 5.85 |
| 44586.020833333336 | 5.58 |
| 44586.03125 | 5.24 |
| 44586.041666666664 | 5.4 |
| 44586.052083333336 | 5.35 |
| 44586.0625 | 5.11 |
| 44586.072916666664 | 5.69 |
| 44586.083333333336 | 5.27 |
| 44586.09375 | 5.23 |
| 44586.104166666664 | 5.11 |
| 44586.114583333336 | 5.14 |
| 44586.125 | 5.16 |
| 44586.135416666664 | 4.94 |
| 44586.145833333336 | 4.82 |
| 44586.15625 | 4.73 |
| 44586.166666666664 | 4.75 |
| 44586.177083333336 | 4.76 |
| 44586.1875 | 4.66 |
| 44586.197916666664 | 4.66 |
| 44586.208333333336 | 4.67 |
| 44586.21875 | 4.7 |
| 44586.229166666664 | 4.35 |
| 44586.239583333336 | 4.46 |
| 44586.25 | 4.35 |
| 44586.260416666664 | 4.3 |
| 44586.270833333336 | 4.13 |
| 44586.28125 | 4.22 |
| 44586.291666666664 | 4.5 |
| 44586.302083333336 | 4.09 |
| 44586.3125 | 4.14 |
| 44586.322916666664 | 4.07 |
| 44586.333333333336 | 4.09 |
| 44586.34375 | 3.98 |
| 44586.354166666664 | 4.36 |
| 44586.364583333336 | 4.14 |
| 44586.375 | 4.44 |
| 44586.385416666664 | 4.45 |
| 44586.395833333336 | 4.83 |
| 44586.40625 | 4.82 |
| 44586.416666666664 | 5.31 |
| 44586.427083333336 | 5.43 |
| 44586.4375 | 5.63 |
| 44586.447916666664 | 5.98 |
| 44586.458333333336 | 6.45 |
| 44586.46875 | 6.65 |
| 44586.479166666664 | 6.56 |
| 44586.489583333336 | 6.37 |
| 44586.5 | 6.34 |
| 44586.510416666664 | 6.52 |
| 44586.520833333336 | 6.16 |
| 44586.53125 | 5.93 |
| 44586.541666666664 | 5.91 |
| 44586.552083333336 | 6.08 |
| 44586.5625 | 6.05 |
| 44586.572916666664 | 6.1 |
| 44586.583333333336 | 6.21 |
| 44586.59375 | 6.23 |
| 44586.604166666664 | 6.06 |
| 44586.614583333336 | 5.68 |
| 44586.625 | 5.73 |
| 44586.635416666664 | 5.32 |
| 44586.645833333336 | 5.33 |
| 44586.65625 | 5.2 |
| 44586.666666666664 | 4.96 |
| 44586.677083333336 | 4.96 |
| 44586.6875 | 4.7 |
| 44586.697916666664 | 4.63 |
| 44586.708333333336 | 4.63 |
| 44586.71875 | 4.48 |
| 44586.729166666664 | 4.3 |
| 44586.739583333336 | 4.39 |
| 44586.75 | 4.29 |
| 44586.760416666664 | 4.13 |
| 44586.770833333336 | 4.18 |
| 44586.78125 | 4.08 |
| 44586.791666666664 | 3.89 |
| 44586.802083333336 | 3.89 |
| 44586.8125 | 4.2 |
| 44586.822916666664 | 3.95 |
| 44586.833333333336 | 4.14 |
| 44586.84375 | 3.9 |
| 44586.854166666664 | 4.01 |
| 44586.864583333336 | 4.15 |
| 44586.875 | 4.12 |
| 44586.885416666664 | 4.2 |
| 44586.895833333336 | 4.23 |
| 44586.90625 | 4.57 |
| 44586.916666666664 | 4.87 |
| 44586.927083333336 | 4.95 |
| 44586.9375 | 5.42 |
| 44586.947916666664 | 5.44 |
| 44586.958333333336 | 5.55 |
| 44586.96875 | 5.52 |
| 44586.979166666664 | 5.52 |
| 44586.989583333336 | 5.5 |
| 44587.0 | 5.74 |
| 44587.010416666664 | 5.87 |
| 44587.020833333336 | 5.84 |
| 44587.03125 | 6.03 |
| 44587.041666666664 | 5.98 |
| 44587.052083333336 | 6.28 |
| 44587.0625 | 5.59 |
| 44587.072916666664 | 5.61 |
| 44587.083333333336 | 5.63 |
| 44587.09375 | 5.65 |
| 44587.104166666664 | 5.29 |
| 44587.114583333336 | 5.34 |
| 44587.125 | 5.2 |
| 44587.135416666664 | 4.7 |
| 44587.145833333336 | 4.81 |
| 44587.15625 | 4.71 |
| 44587.166666666664 | 4.79 |
| 44587.177083333336 | 4.56 |
| 44587.1875 | 4.45 |
| 44587.197916666664 | 4.5 |
| 44587.208333333336 | 4.41 |
| 44587.21875 | 4.33 |
| 44587.229166666664 | 4.18 |
| 44587.239583333336 | 4.37 |
| 44587.25 | 4.32 |
| 44587.260416666664 | 4.33 |
| 44587.270833333336 | 4.34 |
| 44587.28125 | 4.38 |
| 44587.291666666664 | 4.22 |
| 44587.302083333336 | 4.36 |
| 44587.3125 | 4.26 |
| 44587.322916666664 | 4.12 |
| 44587.333333333336 | 3.99 |
| 44587.34375 | 4.22 |
| 44587.354166666664 | 4.22 |
| 44587.364583333336 | 4.31 |
| 44587.375 | 4.13 |
| 44587.385416666664 | 4.04 |
| 44587.395833333336 | 3.95 |
| 44587.40625 | 4.21 |
| 44587.416666666664 | 4.07 |
| 44587.427083333336 | 4.41 |
| 44587.4375 | 4.29 |
| 44587.447916666664 | 4.37 |
| 44587.458333333336 | 4.61 |
| 44587.46875 | 4.93 |
| 44587.479166666664 | 5.49 |
| 44587.489583333336 | 6.09 |
| 44587.5 | 6.34 |
| 44587.510416666664 | 7.38 |
| 44587.520833333336 | 7.03 |
| 44587.53125 | 7.12 |
| 44587.541666666664 | 7.42 |
| 44587.552083333336 | 7.41 |
| 44587.5625 | 7.62 |
| 44587.572916666664 | 7.87 |
| 44587.583333333336 | 7.58 |
| 44587.59375 | 7.58 |
| 44587.604166666664 | 7.1 |
| 44587.614583333336 | 7.12 |
| 44587.625 | 6.88 |
| 44587.635416666664 | 7.04 |
| 44587.645833333336 | 6.94 |
| 44587.65625 | 6.28 |
| 44587.666666666664 | 6.16 |
| 44587.677083333336 | 5.99 |
| 44587.6875 | 5.96 |
| 44587.697916666664 | 5.76 |
| 44587.708333333336 | 6.12 |
| 44587.71875 | 5.51 |
| 44587.729166666664 | 5.26 |
| 44587.739583333336 | 5.25 |
| 44587.75 | 5.29 |
| 44587.760416666664 | 5.39 |
| 44587.770833333336 | 5.37 |
| 44587.78125 | 5.17 |
| 44587.791666666664 | 5.31 |
| 44587.802083333336 | 5 |
| 44587.8125 | 5.14 |
| 44587.822916666664 | 4.9 |
| 44587.833333333336 | 4.84 |
| 44587.84375 | 4.7 |
| 44587.854166666664 | 4.86 |
| 44587.864583333336 | 4.99 |
| 44587.875 | 4.55 |
| 44587.885416666664 | 5.21 |
| 44587.895833333336 | 4.89 |
| 44587.90625 | 5.24 |
| 44587.916666666664 | 5.15 |
| 44587.927083333336 | 5.28 |
| 44587.9375 | 5.52 |
| 44587.947916666664 | 6.32 |
| 44587.958333333336 | 6.78 |
| 44587.96875 | 7.21 |
| 44587.979166666664 | 7.49 |
| 44587.989583333336 | 7.17 |
| 44588.0 | 7.92 |
| 44588.010416666664 | 7.92 |
| 44588.020833333336 | 8.13 |
| 44588.03125 | 8.05 |
| 44588.041666666664 | 8.41 |
| 44588.052083333336 | 8.49 |
| 44588.0625 | 8.45 |
| 44588.072916666664 | 8.3 |
| 44588.083333333336 | 8.28 |
| 44588.09375 | 7.84 |
| 44588.104166666664 | 7.69 |
| 44588.114583333336 | 7.68 |
| 44588.125 | 7.94 |
| 44588.135416666664 | 7.84 |
| 44588.145833333336 | 7.71 |
| 44588.15625 | 7.3 |
| 44588.166666666664 | 7 |
| 44588.177083333336 | 7.01 |
| 44588.1875 | 6.57 |
| 44588.197916666664 | 6.34 |
| 44588.208333333336 | 5.96 |
| 44588.21875 | 5.65 |
| 44588.229166666664 | 5.45 |
| 44588.239583333336 | 5.39 |
| 44588.25 | 5.15 |
| 44588.260416666664 | 5.22 |
| 44588.270833333336 | 5.05 |
| 44588.28125 | 4.92 |
| 44588.291666666664 | 4.91 |
| 44588.302083333336 | 4.86 |
| 44588.3125 | 4.81 |
| 44588.322916666664 | 5.04 |
| 44588.333333333336 | 4.9 |
| 44588.34375 | 4.81 |
| 44588.354166666664 | 4.83 |
| 44588.364583333336 | 4.74 |
| 44588.375 | 4.88 |
| 44588.385416666664 | 4.55 |
| 44588.395833333336 | 4.8 |
| 44588.40625 | 4.59 |
| 44588.416666666664 | 4.64 |
| 44588.427083333336 | 4.66 |
| 44588.4375 | 4.91 |
| 44588.447916666664 | 5.85 |
| 44588.458333333336 | 5.58 |
| 44588.46875 | 5.63 |
| 44588.479166666664 | 5.87 |
| 44588.489583333336 | 6.25 |
| 44588.5 | 5.71 |
| 44588.510416666664 | 7.23 |
| 44588.520833333336 | 6.97 |
| 44588.53125 | 8.06 |
| 44588.541666666664 | 8.12 |
| 44588.552083333336 | 8.51 |
| 44588.5625 | 8.23 |
| 44588.572916666664 | 8.16 |
| 44588.583333333336 | 7.84 |
| 44588.59375 | 8.22 |
| 44588.604166666664 | 8.38 |
| 44588.614583333336 | 8.06 |
| 44588.625 | 9.46 |
| 44588.635416666664 | 7.69 |
| 44588.645833333336 | 7.54 |
| 44588.65625 | 7.53 |
| 44588.666666666664 | 7.99 |
| 44588.677083333336 | 7.16 |
| 44588.6875 | 7.4 |
| 44588.697916666664 | 6.74 |
| 44588.708333333336 | 6.49 |
| 44588.71875 | 6.69 |
| 44588.729166666664 | 6.17 |
| 44588.739583333336 | 6.33 |
| 44588.75 | 5.61 |
| 44588.760416666664 | 5.51 |
| 44588.770833333336 | 5.26 |
| 44588.78125 | 5.31 |
| 44588.791666666664 | 5.13 |
| 44588.802083333336 | 5.03 |
| 44588.8125 | 4.99 |
| 44588.822916666664 | 4.82 |
| 44588.833333333336 | 4.73 |
| 44588.84375 | 4.6 |
| 44588.854166666664 | 4.4 |
| 44588.864583333336 | 4.66 |
| 44588.875 | 4.7 |
| 44588.885416666664 | 4.87 |
| 44588.895833333336 | 4.39 |
| 44588.90625 | 4.61 |
| 44588.916666666664 | 4.45 |
| 44588.927083333336 | 4.69 |
| 44588.9375 | 4.85 |
| 44588.947916666664 | 4.56 |
| 44588.958333333336 | 4.33 |
| 44588.96875 | 4.76 |
| 44588.979166666664 | 4.56 |
| 44588.989583333336 | 5.73 |
| 44589.0 | 5.5 |
| 44589.010416666664 | 5.7 |
| 44589.020833333336 | 5.92 |
| 44589.03125 | 12.83 |
| 44589.041666666664 | 29.64 |
| 44589.052083333336 | 5.89 |
| 44589.0625 | 11.28 |
| 44589.072916666664 | 7.29 |
| 44589.083333333336 | 6.35 |
| 44589.09375 | 6.48 |
| 44589.104166666664 | 6.48 |
| 44589.114583333336 | 6.78 |
| 44589.125 | 5.89 |
| 44589.135416666664 | 6.27 |
| 44589.145833333336 | 6.04 |
| 44589.15625 | 6.43 |
| 44589.166666666664 | 6.13 |
| 44589.177083333336 | 6.07 |
| 44589.1875 | 5.95 |
| 44589.197916666664 | 5.89 |
| 44589.208333333336 | 5.64 |
| 44589.21875 | 5.35 |
| 44589.229166666664 | 5.23 |
| 44589.239583333336 | 5.07 |
| 44589.25 | 4.93 |
| 44589.260416666664 | 5.08 |
| 44589.270833333336 | 4.87 |
| 44589.28125 | 4.73 |
| 44589.291666666664 | 4.58 |
| 44589.302083333336 | 4.65 |
| 44589.3125 | 4.57 |
| 44589.322916666664 | 4.72 |
| 44589.333333333336 | 4.89 |
| 44589.34375 | 4.92 |
| 44589.354166666664 | 4.8 |
| 44589.364583333336 | 4.84 |
| 44589.375 | 4.76 |
| 44589.385416666664 | 4.55 |
| 44589.395833333336 | 4.72 |
| 44589.40625 | 4.69 |
| 44589.416666666664 | 4.76 |
| 44589.427083333336 | 4.07 |
| 44589.4375 | 4.65 |
| 44589.447916666664 | 4.61 |
| 44589.458333333336 | 4.4 |
| 44589.46875 | 4.42 |
| 44589.479166666664 | 4.29 |
| 44589.489583333336 | 4.72 |
| 44589.5 | 4.79 |
| 44589.510416666664 | 5.03 |
| 44589.520833333336 | 5.34 |
| 44589.53125 | 5.21 |
| 44589.541666666664 | 5.76 |
| 44589.552083333336 | 6.6 |
| 44589.5625 | 7 |
| 44589.572916666664 | 6.61 |
| 44589.583333333336 | 7.27 |
| 44589.59375 | 7.48 |
| 44589.604166666664 | 7.51 |
| 44589.614583333336 | 7.33 |
| 44589.625 | 7.43 |
| 44589.635416666664 | 7.53 |
| 44589.645833333336 | 7.39 |
| 44589.65625 | 7.2 |
| 44589.666666666664 | 7.24 |
| 44589.677083333336 | 7.03 |
| 44589.6875 | 7.08 |
| 44589.697916666664 | 6.8 |
| 44589.708333333336 | 7.14 |
| 44589.71875 | 7.27 |
| 44589.729166666664 | 6.88 |
| 44589.739583333336 | 6.96 |
| 44589.75 | 7.01 |
| 44589.760416666664 | 6.66 |
| 44589.770833333336 | 6.64 |
| 44589.78125 | 6.23 |
| 44589.791666666664 | 6.01 |
| 44589.802083333336 | 5.8 |
| 44589.8125 | 6.44 |
| 44589.822916666664 | 5.93 |
| 44589.833333333336 | 6.01 |
| 44589.84375 | 5.8 |
| 44589.854166666664 | 5.59 |
| 44589.864583333336 | 5.39 |
| 44589.875 | 5.17 |
| 44589.885416666664 | 5.07 |
| 44589.895833333336 | 5.06 |
| 44589.90625 | 5.01 |
| 44589.916666666664 | 4.78 |
| 44589.927083333336 | 4.69 |
| 44589.9375 | 4.61 |
| 44589.947916666664 | 4.94 |
| 44589.958333333336 | 4.65 |
| 44589.96875 | 4.8 |
| 44589.979166666664 | 4.65 |
| 44589.989583333336 | 4.66 |
| 44590.0 | 4.72 |
| 44590.010416666664 | 4.72 |
| 44590.020833333336 | 5.27 |
| 44590.03125 | 6.03 |
| 44590.041666666664 | 6.04 |
| 44590.052083333336 | 6.63 |
| 44590.0625 | 9.93 |
| 44590.072916666664 | 24.88 |
| 44590.083333333336 | 8.07 |
| 44590.09375 | 8.4 |
| 44590.104166666664 | 8.74 |
| 44590.114583333336 | 8.39 |
| 44590.125 | 8.35 |
| 44590.135416666664 | 8.03 |
| 44590.145833333336 | 8.32 |
| 44590.15625 | 7.2 |
| 44590.166666666664 | 7.3 |
| 44590.177083333336 | 6.65 |
| 44590.1875 | 6.59 |
| 44590.197916666664 | 7.55 |
| 44590.208333333336 | 7.63 |
| 44590.21875 | 7.04 |
| 44590.229166666664 | 6.92 |
| 44590.239583333336 | 6.46 |
| 44590.25 | 6.74 |
| 44590.260416666664 | 6.54 |
| 44590.270833333336 | 6.28 |
| 44590.28125 | 6.3 |
| 44590.291666666664 | 6.43 |
| 44590.302083333336 | 6.21 |
| 44590.3125 | 6.25 |
| 44590.322916666664 | 6.19 |
| 44590.333333333336 | 6.54 |
| 44590.34375 | 6.68 |
| 44590.354166666664 | 7.08 |
| 44590.364583333336 | 6.99 |
| 44590.375 | 6.93 |
| 44590.385416666664 | 7 |
| 44590.395833333336 | 7.17 |
| 44590.40625 | 7.16 |
| 44590.416666666664 | 7.01 |
| 44590.427083333336 | 7.13 |
| 44590.4375 | 7 |
| 44590.447916666664 | 6.81 |
| 44590.458333333336 | 6.72 |
| 44590.46875 | 6.39 |
| 44590.479166666664 | 6.73 |
| 44590.489583333336 | 6.74 |
| 44590.5 | 6.36 |
| 44590.510416666664 | 6.63 |
| 44590.520833333336 | 6.3 |
| 44590.53125 | 5.7 |
| 44590.541666666664 | 5.6 |
| 44590.552083333336 | 6.01 |
| 44590.5625 | 5.92 |
| 44590.572916666664 | 5.79 |
| 44590.583333333336 | 6 |
| 44590.59375 | 6.52 |
| 44590.604166666664 | 5.95 |
| 44590.614583333336 | 7.68 |
| 44590.625 | 7.55 |
| 44590.635416666664 | 7.16 |
| 44590.645833333336 | 8.36 |
| 44590.65625 | 9.95 |
| 44590.666666666664 | 9.4 |
| 44590.677083333336 | 11.7 |
| 44590.6875 | 10.83 |
| 44590.697916666664 | 11.82 |
| 44590.708333333336 | 11.88 |
| 44590.71875 | 12.08 |
| 44590.729166666664 | 14.41 |
| 44590.739583333336 | 14.85 |
| 44590.75 | 13.85 |
| 44590.760416666664 | 13.43 |
| 44590.770833333336 | 11.96 |
| 44590.78125 | 11.64 |
| 44590.791666666664 | 11.33 |
| 44590.802083333336 | 12.32 |
| 44590.8125 | 16 |
| 44590.822916666664 | 14.3 |
| 44590.833333333336 | 27.45 |
| 44590.84375 | 14.11 |
| 44590.854166666664 | 14.3 |
| 44590.864583333336 | 14.86 |
| 44590.875 | 15.93 |
| 44590.885416666664 | 16.62 |
| 44590.895833333336 | 18.44 |
| 44590.90625 | 18.6 |
| 44590.916666666664 | 17.57 |
| 44590.927083333336 | 17.32 |
| 44590.9375 | 16.47 |
| 44590.947916666664 | 15.62 |
| 44590.958333333336 | 15.84 |
| 44590.96875 | 14.74 |
| 44590.979166666664 | 14.36 |
| 44590.989583333336 | 11.78 |
| 44591.0 | 11.7 |
| 44591.010416666664 | 11.73 |
| 44591.020833333336 | 11.91 |
| 44591.03125 | 11.86 |
| 44591.041666666664 | 11.6 |
| 44591.052083333336 | 12.29 |
| 44591.0625 | 10.67 |
| 44591.072916666664 | 12.04 |
| 44591.083333333336 | 13.13 |
| 44591.09375 | 11.7 |
| 44591.104166666664 | 13.7 |
| 44591.114583333336 | 14.4 |
| 44591.125 | 16.63 |
| 44591.135416666664 | 17.54 |
| 44591.145833333336 | 15.76 |
| 44591.15625 | 17.41 |
| 44591.166666666664 | 18.53 |
| 44591.177083333336 | 17.45 |
| 44591.1875 | 17.52 |
| 44591.197916666664 | 18.95 |
| 44591.208333333336 | 18.15 |
| 44591.21875 | 19.37 |
| 44591.229166666664 | 16.59 |
| 44591.239583333336 | 15.93 |
| 44591.25 | 14.57 |
| 44591.260416666664 | 14.64 |
| 44591.270833333336 | 15.02 |
| 44591.28125 | 14.53 |
| 44591.291666666664 | 16.99 |
| 44591.302083333336 | 18.14 |
| 44591.3125 | 16.35 |
| 44591.322916666664 | 17.34 |
| 44591.333333333336 | 20.03 |
| 44591.34375 | 21.8 |
| 44591.354166666664 | 22.97 |
| 44591.364583333336 | 23.16 |
| 44591.375 | 21.1 |
| 44591.385416666664 | 21.69 |
| 44591.395833333336 | 19.09 |
| 44591.40625 | 17.26 |
| 44591.416666666664 | 16.3 |
| 44591.427083333336 | 15.07 |
| 44591.4375 | 14.89 |
| 44591.447916666664 | 14.3 |
| 44591.458333333336 | 13.99 |
| 44591.46875 | 14 |
| 44591.479166666664 | 13.51 |
| 44591.489583333336 | 13.63 |
| 44591.5 | 13.11 |
| 44591.510416666664 | 13.09 |
| 44591.520833333336 | 10.44 |
| 44591.53125 | 11.78 |
| 44591.541666666664 | 10.48 |
| 44591.552083333336 | 11.59 |
| 44591.5625 | 10.44 |
| 44591.572916666664 | 10.9 |
| 44591.583333333336 | 10.36 |
| 44591.59375 | 9.38 |
| 44591.604166666664 | 9.93 |
| 44591.614583333336 | 9.14 |
| 44591.625 | 10.42 |
| 44591.635416666664 | 11.34 |
| 44591.645833333336 | 11.29 |
| 44591.65625 | 11.59 |
| 44591.666666666664 | 13.23 |
| 44591.677083333336 | 14.62 |
| 44591.6875 | 19.21 |
| 44591.697916666664 | 17.65 |
| 44591.708333333336 | 19.01 |
| 44591.71875 | 15.98 |
| 44591.729166666664 | 15.83 |
| 44591.739583333336 | 15.55 |
| 44591.75 | 15.18 |
| 44591.760416666664 | 14.13 |
| 44591.770833333336 | 13.74 |
| 44591.78125 | 12.36 |
| 44591.791666666664 | 12.12 |
| 44591.802083333336 | 12.23 |
| 44591.8125 | 12.39 |
| 44591.822916666664 | 12.66 |
| 44591.833333333336 | 12.41 |
| 44591.84375 | 11.63 |
| 44591.854166666664 | 11.09 |
| 44591.864583333336 | 11.39 |
| 44591.875 | 11.73 |
| 44591.885416666664 | 11.78 |
| 44591.895833333336 | 12.43 |
| 44591.90625 | 12.19 |
| 44591.916666666664 | 12.72 |
| 44591.927083333336 | 11.88 |
| 44591.9375 | 11.16 |
| 44591.947916666664 | 10.91 |
| 44591.958333333336 | 10.31 |
| 44591.96875 | 9.95 |
| 44591.979166666664 | 9.93 |
| 44591.989583333336 | 9.64 |
| 44592.0 | 9.14 |
| 44592.010416666664 | 9.36 |
| 44592.020833333336 | 9.08 |
| 44592.03125 | 8.54 |
| 44592.041666666664 | 7.87 |
| 44592.052083333336 | 7.6 |
| 44592.0625 | 8.29 |
| 44592.072916666664 | 8.8 |
| 44592.083333333336 | 9.52 |
| 44592.09375 | 9.56 |
| 44592.104166666664 | 10.85 |
| 44592.114583333336 | 14.06 |
| 44592.125 | 15.64 |
| 44592.135416666664 | 15.07 |
| 44592.145833333336 | 12.72 |
| 44592.15625 | 12.95 |
| 44592.166666666664 | 12.55 |
| 44592.177083333336 | 12.02 |
| 44592.1875 | 11.76 |
| 44592.197916666664 | 12.74 |
| 44592.208333333336 | 13.09 |
| 44592.21875 | 13.6 |
| 44592.229166666664 | 13.67 |
| 44592.239583333336 | 11.77 |
| 44592.25 | 11.69 |
| 44592.260416666664 | 12.87 |
| 44592.270833333336 | 11.46 |
| 44592.28125 | 11.39 |
| 44592.291666666664 | 11.17 |
| 44592.302083333336 | 10.98 |
| 44592.3125 | 11.4 |
| 44592.322916666664 | 11.03 |
| 44592.333333333336 | 11.44 |
| 44592.34375 | 12.18 |
| 44592.354166666664 | 12.7 |
| 44592.364583333336 | 11.72 |
| 44592.375 | 10.35 |
| 44592.385416666664 | 9.76 |
| 44592.395833333336 | 8.78 |
| 44592.40625 | 8.67 |
| 44592.416666666664 | 9.24 |
| 44592.427083333336 | 9.57 |
| 44592.4375 | 9.99 |
| 44592.447916666664 | 9.85 |
| 44592.458333333336 | 9.56 |
| 44592.46875 | 9.2 |
| 44592.479166666664 | 8.93 |
| 44592.489583333336 | 8.97 |
| 44592.5 | 8.9 |
| 44592.510416666664 | 8.53 |
| 44592.520833333336 | 8.44 |
| 44592.53125 | 8.53 |
| 44592.541666666664 | 8.31 |
| 44592.552083333336 | 8.3 |
| 44592.5625 | 8.32 |
| 44592.572916666664 | 7.86 |
| 44592.583333333336 | 7.65 |
| 44592.59375 | 7.34 |
| 44592.604166666664 | 7.25 |
| 44592.614583333336 | 7.16 |
| 44592.625 | 7.55 |
| 44592.635416666664 | 7.24 |
| 44592.645833333336 | 7.33 |
| 44592.65625 | 8.47 |
| 44592.666666666664 | 9.16 |
| 44592.677083333336 | 9.35 |
| 44592.6875 | 10.29 |
| 44592.697916666664 | 10.89 |
| 44592.708333333336 | 12.52 |
| 44592.71875 | 12.85 |
| 44592.729166666664 | 13.6 |
| 44592.739583333336 | 13.77 |
| 44592.75 | 14 |
| 44592.760416666664 | 16.57 |
| 44592.770833333336 | 17.49 |
| 44592.78125 | 21.02 |
| 44592.791666666664 | 20.12 |
| 44592.802083333336 | 15.96 |
| 44592.8125 | 23.83 |
| 44592.822916666664 | 21.81 |
| 44592.833333333336 | 18.87 |
| 44592.84375 | 17.92 |
| 44592.854166666664 | 19.65 |
| 44592.864583333336 | 17.52 |
| 44592.875 | 21.16 |
| 44592.885416666664 | 15.6 |
| 44592.895833333336 | 14.51 |
| 44592.90625 | 15.72 |
| 44592.916666666664 | 19.79 |
| 44592.927083333336 | 17.93 |
| 44592.9375 | 23.01 |
| 44592.947916666664 | 24.25 |
| 44592.958333333336 | 25.62 |
| 44592.96875 | 25.61 |
| 44592.979166666664 | 25.36 |
| 44592.989583333336 | 23.3 |
| 44593.0 | 23.17 |
| 44593.010416666664 | 18.82 |
| 44593.020833333336 | 17.05 |
| 44593.03125 | 14.92 |
| 44593.041666666664 | 14.33 |
| 44593.052083333336 | 14.11 |
| 44593.0625 | 12.92 |
| 44593.072916666664 | 12.07 |
| 44593.083333333336 | 11.39 |
| 44593.09375 | 12.01 |
| 44593.104166666664 | 12.33 |
| 44593.114583333336 | 12.37 |
| 44593.125 | 14.17 |
| 44593.135416666664 | 18.43 |
| 44593.145833333336 | 16.79 |
| 44593.15625 | 18.23 |